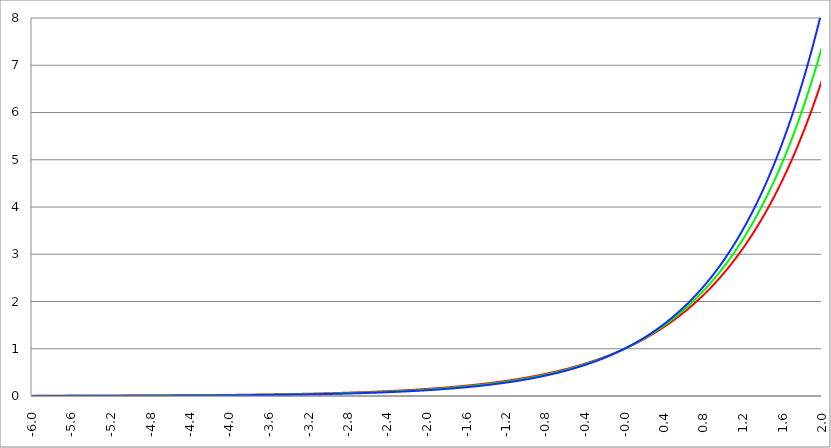
| Category | Series 1 | Series 0 | Series 2 |
|---|---|---|---|
| -6.0 | 0.003 | 0.002 | 0.002 |
| -5.996 | 0.003 | 0.002 | 0.002 |
| -5.992000000000001 | 0.003 | 0.002 | 0.002 |
| -5.988000000000001 | 0.003 | 0.003 | 0.002 |
| -5.984000000000002 | 0.003 | 0.003 | 0.002 |
| -5.980000000000002 | 0.003 | 0.003 | 0.002 |
| -5.976000000000002 | 0.003 | 0.003 | 0.002 |
| -5.972000000000003 | 0.003 | 0.003 | 0.002 |
| -5.968000000000003 | 0.003 | 0.003 | 0.002 |
| -5.964000000000004 | 0.003 | 0.003 | 0.002 |
| -5.960000000000004 | 0.003 | 0.003 | 0.002 |
| -5.956000000000004 | 0.003 | 0.003 | 0.002 |
| -5.952000000000005 | 0.004 | 0.003 | 0.002 |
| -5.948000000000005 | 0.004 | 0.003 | 0.002 |
| -5.944000000000006 | 0.004 | 0.003 | 0.002 |
| -5.940000000000006 | 0.004 | 0.003 | 0.002 |
| -5.936000000000007 | 0.004 | 0.003 | 0.002 |
| -5.932000000000007 | 0.004 | 0.003 | 0.002 |
| -5.928000000000008 | 0.004 | 0.003 | 0.002 |
| -5.924000000000008 | 0.004 | 0.003 | 0.002 |
| -5.920000000000009 | 0.004 | 0.003 | 0.002 |
| -5.91600000000001 | 0.004 | 0.003 | 0.002 |
| -5.91200000000001 | 0.004 | 0.003 | 0.002 |
| -5.90800000000001 | 0.004 | 0.003 | 0.002 |
| -5.904000000000011 | 0.004 | 0.003 | 0.002 |
| -5.900000000000011 | 0.004 | 0.003 | 0.002 |
| -5.896000000000011 | 0.004 | 0.003 | 0.002 |
| -5.892000000000012 | 0.004 | 0.003 | 0.002 |
| -5.888000000000012 | 0.004 | 0.003 | 0.002 |
| -5.884000000000013 | 0.004 | 0.003 | 0.002 |
| -5.880000000000013 | 0.004 | 0.003 | 0.002 |
| -5.876000000000014 | 0.004 | 0.003 | 0.002 |
| -5.872000000000014 | 0.004 | 0.003 | 0.002 |
| -5.868000000000014 | 0.004 | 0.003 | 0.002 |
| -5.864000000000015 | 0.004 | 0.003 | 0.002 |
| -5.860000000000015 | 0.004 | 0.003 | 0.002 |
| -5.856000000000016 | 0.004 | 0.003 | 0.002 |
| -5.852000000000016 | 0.004 | 0.003 | 0.002 |
| -5.848000000000017 | 0.004 | 0.003 | 0.002 |
| -5.844000000000017 | 0.004 | 0.003 | 0.002 |
| -5.840000000000018 | 0.004 | 0.003 | 0.002 |
| -5.836000000000018 | 0.004 | 0.003 | 0.002 |
| -5.832000000000018 | 0.004 | 0.003 | 0.002 |
| -5.828000000000019 | 0.004 | 0.003 | 0.002 |
| -5.824000000000019 | 0.004 | 0.003 | 0.002 |
| -5.82000000000002 | 0.004 | 0.003 | 0.002 |
| -5.81600000000002 | 0.004 | 0.003 | 0.002 |
| -5.812000000000021 | 0.004 | 0.003 | 0.002 |
| -5.808000000000021 | 0.004 | 0.003 | 0.002 |
| -5.804000000000022 | 0.004 | 0.003 | 0.002 |
| -5.800000000000022 | 0.004 | 0.003 | 0.002 |
| -5.796000000000022 | 0.004 | 0.003 | 0.002 |
| -5.792000000000023 | 0.004 | 0.003 | 0.002 |
| -5.788000000000023 | 0.004 | 0.003 | 0.002 |
| -5.784000000000024 | 0.004 | 0.003 | 0.002 |
| -5.780000000000024 | 0.004 | 0.003 | 0.002 |
| -5.776000000000024 | 0.004 | 0.003 | 0.002 |
| -5.772000000000025 | 0.004 | 0.003 | 0.002 |
| -5.768000000000025 | 0.004 | 0.003 | 0.002 |
| -5.764000000000026 | 0.004 | 0.003 | 0.002 |
| -5.760000000000026 | 0.004 | 0.003 | 0.002 |
| -5.756000000000026 | 0.004 | 0.003 | 0.002 |
| -5.752000000000027 | 0.004 | 0.003 | 0.002 |
| -5.748000000000027 | 0.004 | 0.003 | 0.002 |
| -5.744000000000028 | 0.004 | 0.003 | 0.002 |
| -5.740000000000028 | 0.004 | 0.003 | 0.002 |
| -5.73600000000003 | 0.004 | 0.003 | 0.002 |
| -5.73200000000003 | 0.004 | 0.003 | 0.002 |
| -5.72800000000003 | 0.004 | 0.003 | 0.002 |
| -5.72400000000003 | 0.004 | 0.003 | 0.002 |
| -5.720000000000031 | 0.004 | 0.003 | 0.002 |
| -5.716000000000031 | 0.004 | 0.003 | 0.002 |
| -5.712000000000032 | 0.004 | 0.003 | 0.002 |
| -5.708000000000032 | 0.004 | 0.003 | 0.002 |
| -5.704000000000033 | 0.004 | 0.003 | 0.003 |
| -5.700000000000033 | 0.004 | 0.003 | 0.003 |
| -5.696000000000033 | 0.004 | 0.003 | 0.003 |
| -5.692000000000034 | 0.004 | 0.003 | 0.003 |
| -5.688000000000034 | 0.005 | 0.003 | 0.003 |
| -5.684000000000035 | 0.005 | 0.003 | 0.003 |
| -5.680000000000035 | 0.005 | 0.003 | 0.003 |
| -5.676000000000035 | 0.005 | 0.003 | 0.003 |
| -5.672000000000036 | 0.005 | 0.003 | 0.003 |
| -5.668000000000036 | 0.005 | 0.003 | 0.003 |
| -5.664000000000037 | 0.005 | 0.003 | 0.003 |
| -5.660000000000037 | 0.005 | 0.003 | 0.003 |
| -5.656000000000038 | 0.005 | 0.003 | 0.003 |
| -5.652000000000038 | 0.005 | 0.004 | 0.003 |
| -5.648000000000039 | 0.005 | 0.004 | 0.003 |
| -5.644000000000039 | 0.005 | 0.004 | 0.003 |
| -5.64000000000004 | 0.005 | 0.004 | 0.003 |
| -5.63600000000004 | 0.005 | 0.004 | 0.003 |
| -5.63200000000004 | 0.005 | 0.004 | 0.003 |
| -5.628000000000041 | 0.005 | 0.004 | 0.003 |
| -5.624000000000041 | 0.005 | 0.004 | 0.003 |
| -5.620000000000042 | 0.005 | 0.004 | 0.003 |
| -5.616000000000042 | 0.005 | 0.004 | 0.003 |
| -5.612000000000043 | 0.005 | 0.004 | 0.003 |
| -5.608000000000043 | 0.005 | 0.004 | 0.003 |
| -5.604000000000044 | 0.005 | 0.004 | 0.003 |
| -5.600000000000044 | 0.005 | 0.004 | 0.003 |
| -5.596000000000044 | 0.005 | 0.004 | 0.003 |
| -5.592000000000045 | 0.005 | 0.004 | 0.003 |
| -5.588000000000045 | 0.005 | 0.004 | 0.003 |
| -5.584000000000046 | 0.005 | 0.004 | 0.003 |
| -5.580000000000046 | 0.005 | 0.004 | 0.003 |
| -5.576000000000046 | 0.005 | 0.004 | 0.003 |
| -5.572000000000047 | 0.005 | 0.004 | 0.003 |
| -5.568000000000048 | 0.005 | 0.004 | 0.003 |
| -5.564000000000048 | 0.005 | 0.004 | 0.003 |
| -5.560000000000048 | 0.005 | 0.004 | 0.003 |
| -5.556000000000049 | 0.005 | 0.004 | 0.003 |
| -5.552000000000049 | 0.005 | 0.004 | 0.003 |
| -5.54800000000005 | 0.005 | 0.004 | 0.003 |
| -5.54400000000005 | 0.005 | 0.004 | 0.003 |
| -5.540000000000051 | 0.005 | 0.004 | 0.003 |
| -5.536000000000051 | 0.005 | 0.004 | 0.003 |
| -5.532000000000052 | 0.005 | 0.004 | 0.003 |
| -5.528000000000052 | 0.005 | 0.004 | 0.003 |
| -5.524000000000052 | 0.005 | 0.004 | 0.003 |
| -5.520000000000053 | 0.005 | 0.004 | 0.003 |
| -5.516000000000053 | 0.005 | 0.004 | 0.003 |
| -5.512000000000054 | 0.005 | 0.004 | 0.003 |
| -5.508000000000054 | 0.005 | 0.004 | 0.003 |
| -5.504000000000055 | 0.005 | 0.004 | 0.003 |
| -5.500000000000055 | 0.005 | 0.004 | 0.003 |
| -5.496000000000055 | 0.005 | 0.004 | 0.003 |
| -5.492000000000056 | 0.005 | 0.004 | 0.003 |
| -5.488000000000056 | 0.005 | 0.004 | 0.003 |
| -5.484000000000057 | 0.005 | 0.004 | 0.003 |
| -5.480000000000057 | 0.005 | 0.004 | 0.003 |
| -5.476000000000057 | 0.006 | 0.004 | 0.003 |
| -5.472000000000058 | 0.006 | 0.004 | 0.003 |
| -5.468000000000059 | 0.006 | 0.004 | 0.003 |
| -5.464000000000059 | 0.006 | 0.004 | 0.003 |
| -5.460000000000059 | 0.006 | 0.004 | 0.003 |
| -5.45600000000006 | 0.006 | 0.004 | 0.003 |
| -5.45200000000006 | 0.006 | 0.004 | 0.003 |
| -5.44800000000006 | 0.006 | 0.004 | 0.003 |
| -5.444000000000061 | 0.006 | 0.004 | 0.003 |
| -5.440000000000061 | 0.006 | 0.004 | 0.003 |
| -5.436000000000062 | 0.006 | 0.004 | 0.003 |
| -5.432000000000062 | 0.006 | 0.004 | 0.003 |
| -5.428000000000063 | 0.006 | 0.004 | 0.003 |
| -5.424000000000063 | 0.006 | 0.004 | 0.003 |
| -5.420000000000064 | 0.006 | 0.004 | 0.003 |
| -5.416000000000064 | 0.006 | 0.004 | 0.003 |
| -5.412000000000064 | 0.006 | 0.004 | 0.003 |
| -5.408000000000065 | 0.006 | 0.004 | 0.003 |
| -5.404000000000065 | 0.006 | 0.004 | 0.003 |
| -5.400000000000066 | 0.006 | 0.005 | 0.003 |
| -5.396000000000066 | 0.006 | 0.005 | 0.003 |
| -5.392000000000067 | 0.006 | 0.005 | 0.003 |
| -5.388000000000067 | 0.006 | 0.005 | 0.003 |
| -5.384000000000068 | 0.006 | 0.005 | 0.004 |
| -5.380000000000068 | 0.006 | 0.005 | 0.004 |
| -5.376000000000068 | 0.006 | 0.005 | 0.004 |
| -5.37200000000007 | 0.006 | 0.005 | 0.004 |
| -5.36800000000007 | 0.006 | 0.005 | 0.004 |
| -5.36400000000007 | 0.006 | 0.005 | 0.004 |
| -5.36000000000007 | 0.006 | 0.005 | 0.004 |
| -5.356000000000071 | 0.006 | 0.005 | 0.004 |
| -5.352000000000071 | 0.006 | 0.005 | 0.004 |
| -5.348000000000072 | 0.006 | 0.005 | 0.004 |
| -5.344000000000072 | 0.006 | 0.005 | 0.004 |
| -5.340000000000073 | 0.006 | 0.005 | 0.004 |
| -5.336000000000073 | 0.006 | 0.005 | 0.004 |
| -5.332000000000074 | 0.006 | 0.005 | 0.004 |
| -5.328000000000074 | 0.006 | 0.005 | 0.004 |
| -5.324000000000074 | 0.006 | 0.005 | 0.004 |
| -5.320000000000075 | 0.006 | 0.005 | 0.004 |
| -5.316000000000075 | 0.006 | 0.005 | 0.004 |
| -5.312000000000076 | 0.006 | 0.005 | 0.004 |
| -5.308000000000076 | 0.006 | 0.005 | 0.004 |
| -5.304000000000077 | 0.006 | 0.005 | 0.004 |
| -5.300000000000077 | 0.007 | 0.005 | 0.004 |
| -5.296000000000077 | 0.007 | 0.005 | 0.004 |
| -5.292000000000078 | 0.007 | 0.005 | 0.004 |
| -5.288000000000078 | 0.007 | 0.005 | 0.004 |
| -5.284000000000079 | 0.007 | 0.005 | 0.004 |
| -5.28000000000008 | 0.007 | 0.005 | 0.004 |
| -5.27600000000008 | 0.007 | 0.005 | 0.004 |
| -5.27200000000008 | 0.007 | 0.005 | 0.004 |
| -5.268000000000081 | 0.007 | 0.005 | 0.004 |
| -5.264000000000081 | 0.007 | 0.005 | 0.004 |
| -5.260000000000081 | 0.007 | 0.005 | 0.004 |
| -5.256000000000082 | 0.007 | 0.005 | 0.004 |
| -5.252000000000082 | 0.007 | 0.005 | 0.004 |
| -5.248000000000083 | 0.007 | 0.005 | 0.004 |
| -5.244000000000083 | 0.007 | 0.005 | 0.004 |
| -5.240000000000084 | 0.007 | 0.005 | 0.004 |
| -5.236000000000084 | 0.007 | 0.005 | 0.004 |
| -5.232000000000084 | 0.007 | 0.005 | 0.004 |
| -5.228000000000085 | 0.007 | 0.005 | 0.004 |
| -5.224000000000085 | 0.007 | 0.005 | 0.004 |
| -5.220000000000086 | 0.007 | 0.005 | 0.004 |
| -5.216000000000086 | 0.007 | 0.005 | 0.004 |
| -5.212000000000087 | 0.007 | 0.005 | 0.004 |
| -5.208000000000087 | 0.007 | 0.005 | 0.004 |
| -5.204000000000088 | 0.007 | 0.005 | 0.004 |
| -5.200000000000088 | 0.007 | 0.006 | 0.004 |
| -5.196000000000089 | 0.007 | 0.006 | 0.004 |
| -5.192000000000089 | 0.007 | 0.006 | 0.004 |
| -5.188000000000089 | 0.007 | 0.006 | 0.004 |
| -5.18400000000009 | 0.007 | 0.006 | 0.004 |
| -5.18000000000009 | 0.007 | 0.006 | 0.004 |
| -5.176000000000091 | 0.007 | 0.006 | 0.004 |
| -5.172000000000091 | 0.007 | 0.006 | 0.004 |
| -5.168000000000092 | 0.007 | 0.006 | 0.004 |
| -5.164000000000092 | 0.007 | 0.006 | 0.004 |
| -5.160000000000092 | 0.007 | 0.006 | 0.004 |
| -5.156000000000093 | 0.007 | 0.006 | 0.004 |
| -5.152000000000093 | 0.007 | 0.006 | 0.004 |
| -5.148000000000094 | 0.008 | 0.006 | 0.004 |
| -5.144000000000094 | 0.008 | 0.006 | 0.005 |
| -5.140000000000095 | 0.008 | 0.006 | 0.005 |
| -5.136000000000095 | 0.008 | 0.006 | 0.005 |
| -5.132000000000096 | 0.008 | 0.006 | 0.005 |
| -5.128000000000096 | 0.008 | 0.006 | 0.005 |
| -5.124000000000096 | 0.008 | 0.006 | 0.005 |
| -5.120000000000097 | 0.008 | 0.006 | 0.005 |
| -5.116000000000097 | 0.008 | 0.006 | 0.005 |
| -5.112000000000098 | 0.008 | 0.006 | 0.005 |
| -5.108000000000098 | 0.008 | 0.006 | 0.005 |
| -5.104000000000099 | 0.008 | 0.006 | 0.005 |
| -5.100000000000099 | 0.008 | 0.006 | 0.005 |
| -5.0960000000001 | 0.008 | 0.006 | 0.005 |
| -5.0920000000001 | 0.008 | 0.006 | 0.005 |
| -5.0880000000001 | 0.008 | 0.006 | 0.005 |
| -5.084000000000101 | 0.008 | 0.006 | 0.005 |
| -5.080000000000101 | 0.008 | 0.006 | 0.005 |
| -5.076000000000101 | 0.008 | 0.006 | 0.005 |
| -5.072000000000102 | 0.008 | 0.006 | 0.005 |
| -5.068000000000103 | 0.008 | 0.006 | 0.005 |
| -5.064000000000103 | 0.008 | 0.006 | 0.005 |
| -5.060000000000104 | 0.008 | 0.006 | 0.005 |
| -5.056000000000104 | 0.008 | 0.006 | 0.005 |
| -5.052000000000104 | 0.008 | 0.006 | 0.005 |
| -5.048000000000104 | 0.008 | 0.006 | 0.005 |
| -5.044000000000105 | 0.008 | 0.006 | 0.005 |
| -5.040000000000105 | 0.008 | 0.006 | 0.005 |
| -5.036000000000106 | 0.008 | 0.006 | 0.005 |
| -5.032000000000106 | 0.008 | 0.007 | 0.005 |
| -5.028000000000107 | 0.008 | 0.007 | 0.005 |
| -5.024000000000107 | 0.008 | 0.007 | 0.005 |
| -5.020000000000108 | 0.008 | 0.007 | 0.005 |
| -5.016000000000108 | 0.009 | 0.007 | 0.005 |
| -5.012000000000109 | 0.009 | 0.007 | 0.005 |
| -5.00800000000011 | 0.009 | 0.007 | 0.005 |
| -5.00400000000011 | 0.009 | 0.007 | 0.005 |
| -5.00000000000011 | 0.009 | 0.007 | 0.005 |
| -4.99600000000011 | 0.009 | 0.007 | 0.005 |
| -4.992000000000111 | 0.009 | 0.007 | 0.005 |
| -4.988000000000111 | 0.009 | 0.007 | 0.005 |
| -4.984000000000112 | 0.009 | 0.007 | 0.005 |
| -4.980000000000112 | 0.009 | 0.007 | 0.005 |
| -4.976000000000112 | 0.009 | 0.007 | 0.005 |
| -4.972000000000113 | 0.009 | 0.007 | 0.005 |
| -4.968000000000114 | 0.009 | 0.007 | 0.005 |
| -4.964000000000114 | 0.009 | 0.007 | 0.005 |
| -4.960000000000114 | 0.009 | 0.007 | 0.005 |
| -4.956000000000114 | 0.009 | 0.007 | 0.005 |
| -4.952000000000115 | 0.009 | 0.007 | 0.006 |
| -4.948000000000115 | 0.009 | 0.007 | 0.006 |
| -4.944000000000116 | 0.009 | 0.007 | 0.006 |
| -4.940000000000116 | 0.009 | 0.007 | 0.006 |
| -4.936000000000117 | 0.009 | 0.007 | 0.006 |
| -4.932000000000117 | 0.009 | 0.007 | 0.006 |
| -4.928000000000118 | 0.009 | 0.007 | 0.006 |
| -4.924000000000118 | 0.009 | 0.007 | 0.006 |
| -4.920000000000119 | 0.009 | 0.007 | 0.006 |
| -4.91600000000012 | 0.009 | 0.007 | 0.006 |
| -4.91200000000012 | 0.009 | 0.007 | 0.006 |
| -4.90800000000012 | 0.009 | 0.007 | 0.006 |
| -4.90400000000012 | 0.009 | 0.007 | 0.006 |
| -4.90000000000012 | 0.01 | 0.007 | 0.006 |
| -4.896000000000121 | 0.01 | 0.007 | 0.006 |
| -4.892000000000122 | 0.01 | 0.008 | 0.006 |
| -4.888000000000122 | 0.01 | 0.008 | 0.006 |
| -4.884000000000123 | 0.01 | 0.008 | 0.006 |
| -4.880000000000123 | 0.01 | 0.008 | 0.006 |
| -4.876000000000123 | 0.01 | 0.008 | 0.006 |
| -4.872000000000124 | 0.01 | 0.008 | 0.006 |
| -4.868000000000124 | 0.01 | 0.008 | 0.006 |
| -4.864000000000125 | 0.01 | 0.008 | 0.006 |
| -4.860000000000125 | 0.01 | 0.008 | 0.006 |
| -4.856000000000125 | 0.01 | 0.008 | 0.006 |
| -4.852000000000126 | 0.01 | 0.008 | 0.006 |
| -4.848000000000126 | 0.01 | 0.008 | 0.006 |
| -4.844000000000127 | 0.01 | 0.008 | 0.006 |
| -4.840000000000127 | 0.01 | 0.008 | 0.006 |
| -4.836000000000128 | 0.01 | 0.008 | 0.006 |
| -4.832000000000128 | 0.01 | 0.008 | 0.006 |
| -4.82800000000013 | 0.01 | 0.008 | 0.006 |
| -4.824000000000129 | 0.01 | 0.008 | 0.006 |
| -4.82000000000013 | 0.01 | 0.008 | 0.006 |
| -4.81600000000013 | 0.01 | 0.008 | 0.006 |
| -4.812000000000131 | 0.01 | 0.008 | 0.006 |
| -4.808000000000131 | 0.01 | 0.008 | 0.006 |
| -4.804000000000132 | 0.01 | 0.008 | 0.006 |
| -4.800000000000132 | 0.01 | 0.008 | 0.006 |
| -4.796000000000132 | 0.011 | 0.008 | 0.007 |
| -4.792000000000133 | 0.011 | 0.008 | 0.007 |
| -4.788000000000133 | 0.011 | 0.008 | 0.007 |
| -4.784000000000134 | 0.011 | 0.008 | 0.007 |
| -4.780000000000134 | 0.011 | 0.008 | 0.007 |
| -4.776000000000134 | 0.011 | 0.008 | 0.007 |
| -4.772000000000135 | 0.011 | 0.008 | 0.007 |
| -4.768000000000135 | 0.011 | 0.008 | 0.007 |
| -4.764000000000136 | 0.011 | 0.009 | 0.007 |
| -4.760000000000136 | 0.011 | 0.009 | 0.007 |
| -4.756000000000136 | 0.011 | 0.009 | 0.007 |
| -4.752000000000137 | 0.011 | 0.009 | 0.007 |
| -4.748000000000137 | 0.011 | 0.009 | 0.007 |
| -4.744000000000138 | 0.011 | 0.009 | 0.007 |
| -4.740000000000138 | 0.011 | 0.009 | 0.007 |
| -4.73600000000014 | 0.011 | 0.009 | 0.007 |
| -4.73200000000014 | 0.011 | 0.009 | 0.007 |
| -4.72800000000014 | 0.011 | 0.009 | 0.007 |
| -4.72400000000014 | 0.011 | 0.009 | 0.007 |
| -4.720000000000141 | 0.011 | 0.009 | 0.007 |
| -4.716000000000141 | 0.011 | 0.009 | 0.007 |
| -4.712000000000142 | 0.011 | 0.009 | 0.007 |
| -4.708000000000142 | 0.011 | 0.009 | 0.007 |
| -4.704000000000143 | 0.011 | 0.009 | 0.007 |
| -4.700000000000143 | 0.012 | 0.009 | 0.007 |
| -4.696000000000143 | 0.012 | 0.009 | 0.007 |
| -4.692000000000144 | 0.012 | 0.009 | 0.007 |
| -4.688000000000144 | 0.012 | 0.009 | 0.007 |
| -4.684000000000145 | 0.012 | 0.009 | 0.007 |
| -4.680000000000145 | 0.012 | 0.009 | 0.007 |
| -4.676000000000145 | 0.012 | 0.009 | 0.007 |
| -4.672000000000146 | 0.012 | 0.009 | 0.007 |
| -4.668000000000147 | 0.012 | 0.009 | 0.007 |
| -4.664000000000147 | 0.012 | 0.009 | 0.007 |
| -4.660000000000147 | 0.012 | 0.009 | 0.007 |
| -4.656000000000148 | 0.012 | 0.01 | 0.008 |
| -4.652000000000148 | 0.012 | 0.01 | 0.008 |
| -4.648000000000149 | 0.012 | 0.01 | 0.008 |
| -4.644000000000149 | 0.012 | 0.01 | 0.008 |
| -4.64000000000015 | 0.012 | 0.01 | 0.008 |
| -4.63600000000015 | 0.012 | 0.01 | 0.008 |
| -4.632000000000151 | 0.012 | 0.01 | 0.008 |
| -4.628000000000151 | 0.012 | 0.01 | 0.008 |
| -4.624000000000151 | 0.012 | 0.01 | 0.008 |
| -4.620000000000152 | 0.012 | 0.01 | 0.008 |
| -4.616000000000152 | 0.012 | 0.01 | 0.008 |
| -4.612000000000153 | 0.013 | 0.01 | 0.008 |
| -4.608000000000153 | 0.013 | 0.01 | 0.008 |
| -4.604000000000154 | 0.013 | 0.01 | 0.008 |
| -4.600000000000154 | 0.013 | 0.01 | 0.008 |
| -4.596000000000154 | 0.013 | 0.01 | 0.008 |
| -4.592000000000155 | 0.013 | 0.01 | 0.008 |
| -4.588000000000155 | 0.013 | 0.01 | 0.008 |
| -4.584000000000156 | 0.013 | 0.01 | 0.008 |
| -4.580000000000156 | 0.013 | 0.01 | 0.008 |
| -4.576000000000156 | 0.013 | 0.01 | 0.008 |
| -4.572000000000157 | 0.013 | 0.01 | 0.008 |
| -4.568000000000158 | 0.013 | 0.01 | 0.008 |
| -4.564000000000158 | 0.013 | 0.01 | 0.008 |
| -4.560000000000159 | 0.013 | 0.01 | 0.008 |
| -4.55600000000016 | 0.013 | 0.011 | 0.008 |
| -4.552000000000159 | 0.013 | 0.011 | 0.008 |
| -4.54800000000016 | 0.013 | 0.011 | 0.008 |
| -4.54400000000016 | 0.013 | 0.011 | 0.008 |
| -4.54000000000016 | 0.013 | 0.011 | 0.009 |
| -4.53600000000016 | 0.013 | 0.011 | 0.009 |
| -4.532000000000161 | 0.013 | 0.011 | 0.009 |
| -4.528000000000162 | 0.014 | 0.011 | 0.009 |
| -4.524000000000163 | 0.014 | 0.011 | 0.009 |
| -4.520000000000163 | 0.014 | 0.011 | 0.009 |
| -4.516000000000163 | 0.014 | 0.011 | 0.009 |
| -4.512000000000164 | 0.014 | 0.011 | 0.009 |
| -4.508000000000164 | 0.014 | 0.011 | 0.009 |
| -4.504000000000164 | 0.014 | 0.011 | 0.009 |
| -4.500000000000165 | 0.014 | 0.011 | 0.009 |
| -4.496000000000165 | 0.014 | 0.011 | 0.009 |
| -4.492000000000166 | 0.014 | 0.011 | 0.009 |
| -4.488000000000166 | 0.014 | 0.011 | 0.009 |
| -4.484000000000166 | 0.014 | 0.011 | 0.009 |
| -4.480000000000167 | 0.014 | 0.011 | 0.009 |
| -4.476000000000167 | 0.014 | 0.011 | 0.009 |
| -4.472000000000168 | 0.014 | 0.011 | 0.009 |
| -4.468000000000168 | 0.014 | 0.011 | 0.009 |
| -4.46400000000017 | 0.014 | 0.012 | 0.009 |
| -4.46000000000017 | 0.014 | 0.012 | 0.009 |
| -4.45600000000017 | 0.015 | 0.012 | 0.009 |
| -4.45200000000017 | 0.015 | 0.012 | 0.009 |
| -4.44800000000017 | 0.015 | 0.012 | 0.009 |
| -4.444000000000171 | 0.015 | 0.012 | 0.009 |
| -4.440000000000171 | 0.015 | 0.012 | 0.009 |
| -4.436000000000172 | 0.015 | 0.012 | 0.009 |
| -4.432000000000172 | 0.015 | 0.012 | 0.01 |
| -4.428000000000173 | 0.015 | 0.012 | 0.01 |
| -4.424000000000174 | 0.015 | 0.012 | 0.01 |
| -4.420000000000174 | 0.015 | 0.012 | 0.01 |
| -4.416000000000174 | 0.015 | 0.012 | 0.01 |
| -4.412000000000174 | 0.015 | 0.012 | 0.01 |
| -4.408000000000175 | 0.015 | 0.012 | 0.01 |
| -4.404000000000175 | 0.015 | 0.012 | 0.01 |
| -4.400000000000176 | 0.015 | 0.012 | 0.01 |
| -4.396000000000176 | 0.015 | 0.012 | 0.01 |
| -4.392000000000177 | 0.015 | 0.012 | 0.01 |
| -4.388000000000177 | 0.015 | 0.012 | 0.01 |
| -4.384000000000178 | 0.016 | 0.012 | 0.01 |
| -4.380000000000178 | 0.016 | 0.013 | 0.01 |
| -4.376000000000178 | 0.016 | 0.013 | 0.01 |
| -4.37200000000018 | 0.016 | 0.013 | 0.01 |
| -4.36800000000018 | 0.016 | 0.013 | 0.01 |
| -4.36400000000018 | 0.016 | 0.013 | 0.01 |
| -4.360000000000181 | 0.016 | 0.013 | 0.01 |
| -4.356000000000181 | 0.016 | 0.013 | 0.01 |
| -4.352000000000181 | 0.016 | 0.013 | 0.01 |
| -4.348000000000182 | 0.016 | 0.013 | 0.01 |
| -4.344000000000182 | 0.016 | 0.013 | 0.01 |
| -4.340000000000183 | 0.016 | 0.013 | 0.01 |
| -4.336000000000183 | 0.016 | 0.013 | 0.011 |
| -4.332000000000184 | 0.016 | 0.013 | 0.011 |
| -4.328000000000184 | 0.016 | 0.013 | 0.011 |
| -4.324000000000185 | 0.016 | 0.013 | 0.011 |
| -4.320000000000185 | 0.017 | 0.013 | 0.011 |
| -4.316000000000185 | 0.017 | 0.013 | 0.011 |
| -4.312000000000186 | 0.017 | 0.013 | 0.011 |
| -4.308000000000186 | 0.017 | 0.013 | 0.011 |
| -4.304000000000187 | 0.017 | 0.014 | 0.011 |
| -4.300000000000187 | 0.017 | 0.014 | 0.011 |
| -4.296000000000187 | 0.017 | 0.014 | 0.011 |
| -4.292000000000188 | 0.017 | 0.014 | 0.011 |
| -4.288000000000188 | 0.017 | 0.014 | 0.011 |
| -4.284000000000189 | 0.017 | 0.014 | 0.011 |
| -4.28000000000019 | 0.017 | 0.014 | 0.011 |
| -4.27600000000019 | 0.017 | 0.014 | 0.011 |
| -4.27200000000019 | 0.017 | 0.014 | 0.011 |
| -4.268000000000191 | 0.017 | 0.014 | 0.011 |
| -4.264000000000191 | 0.017 | 0.014 | 0.011 |
| -4.260000000000192 | 0.017 | 0.014 | 0.011 |
| -4.256000000000192 | 0.018 | 0.014 | 0.011 |
| -4.252000000000192 | 0.018 | 0.014 | 0.012 |
| -4.248000000000193 | 0.018 | 0.014 | 0.012 |
| -4.244000000000193 | 0.018 | 0.014 | 0.012 |
| -4.240000000000194 | 0.018 | 0.014 | 0.012 |
| -4.236000000000194 | 0.018 | 0.014 | 0.012 |
| -4.232000000000194 | 0.018 | 0.015 | 0.012 |
| -4.228000000000195 | 0.018 | 0.015 | 0.012 |
| -4.224000000000196 | 0.018 | 0.015 | 0.012 |
| -4.220000000000196 | 0.018 | 0.015 | 0.012 |
| -4.216000000000196 | 0.018 | 0.015 | 0.012 |
| -4.212000000000197 | 0.018 | 0.015 | 0.012 |
| -4.208000000000197 | 0.018 | 0.015 | 0.012 |
| -4.204000000000198 | 0.018 | 0.015 | 0.012 |
| -4.200000000000198 | 0.018 | 0.015 | 0.012 |
| -4.196000000000199 | 0.019 | 0.015 | 0.012 |
| -4.192000000000199 | 0.019 | 0.015 | 0.012 |
| -4.1880000000002 | 0.019 | 0.015 | 0.012 |
| -4.1840000000002 | 0.019 | 0.015 | 0.012 |
| -4.1800000000002 | 0.019 | 0.015 | 0.012 |
| -4.176000000000201 | 0.019 | 0.015 | 0.012 |
| -4.172000000000201 | 0.019 | 0.015 | 0.013 |
| -4.168000000000202 | 0.019 | 0.015 | 0.013 |
| -4.164000000000202 | 0.019 | 0.016 | 0.013 |
| -4.160000000000203 | 0.019 | 0.016 | 0.013 |
| -4.156000000000203 | 0.019 | 0.016 | 0.013 |
| -4.152000000000204 | 0.019 | 0.016 | 0.013 |
| -4.148000000000204 | 0.019 | 0.016 | 0.013 |
| -4.144000000000204 | 0.02 | 0.016 | 0.013 |
| -4.140000000000205 | 0.02 | 0.016 | 0.013 |
| -4.136000000000205 | 0.02 | 0.016 | 0.013 |
| -4.132000000000206 | 0.02 | 0.016 | 0.013 |
| -4.128000000000206 | 0.02 | 0.016 | 0.013 |
| -4.124000000000207 | 0.02 | 0.016 | 0.013 |
| -4.120000000000207 | 0.02 | 0.016 | 0.013 |
| -4.116000000000207 | 0.02 | 0.016 | 0.013 |
| -4.112000000000208 | 0.02 | 0.016 | 0.013 |
| -4.108000000000208 | 0.02 | 0.016 | 0.013 |
| -4.104000000000209 | 0.02 | 0.017 | 0.013 |
| -4.100000000000209 | 0.02 | 0.017 | 0.014 |
| -4.09600000000021 | 0.02 | 0.017 | 0.014 |
| -4.09200000000021 | 0.02 | 0.017 | 0.014 |
| -4.088000000000211 | 0.021 | 0.017 | 0.014 |
| -4.084000000000211 | 0.021 | 0.017 | 0.014 |
| -4.080000000000211 | 0.021 | 0.017 | 0.014 |
| -4.076000000000212 | 0.021 | 0.017 | 0.014 |
| -4.072000000000212 | 0.021 | 0.017 | 0.014 |
| -4.068000000000213 | 0.021 | 0.017 | 0.014 |
| -4.064000000000213 | 0.021 | 0.017 | 0.014 |
| -4.060000000000214 | 0.021 | 0.017 | 0.014 |
| -4.056000000000214 | 0.021 | 0.017 | 0.014 |
| -4.052000000000215 | 0.021 | 0.017 | 0.014 |
| -4.048000000000215 | 0.021 | 0.017 | 0.014 |
| -4.044000000000215 | 0.021 | 0.018 | 0.014 |
| -4.040000000000216 | 0.022 | 0.018 | 0.014 |
| -4.036000000000216 | 0.022 | 0.018 | 0.014 |
| -4.032000000000217 | 0.022 | 0.018 | 0.015 |
| -4.028000000000217 | 0.022 | 0.018 | 0.015 |
| -4.024000000000218 | 0.022 | 0.018 | 0.015 |
| -4.020000000000218 | 0.022 | 0.018 | 0.015 |
| -4.016000000000219 | 0.022 | 0.018 | 0.015 |
| -4.012000000000219 | 0.022 | 0.018 | 0.015 |
| -4.008000000000219 | 0.022 | 0.018 | 0.015 |
| -4.00400000000022 | 0.022 | 0.018 | 0.015 |
| -4.00000000000022 | 0.022 | 0.018 | 0.015 |
| -3.99600000000022 | 0.022 | 0.018 | 0.015 |
| -3.99200000000022 | 0.023 | 0.018 | 0.015 |
| -3.98800000000022 | 0.023 | 0.019 | 0.015 |
| -3.98400000000022 | 0.023 | 0.019 | 0.015 |
| -3.98000000000022 | 0.023 | 0.019 | 0.015 |
| -3.97600000000022 | 0.023 | 0.019 | 0.015 |
| -3.97200000000022 | 0.023 | 0.019 | 0.015 |
| -3.96800000000022 | 0.023 | 0.019 | 0.016 |
| -3.96400000000022 | 0.023 | 0.019 | 0.016 |
| -3.96000000000022 | 0.023 | 0.019 | 0.016 |
| -3.95600000000022 | 0.023 | 0.019 | 0.016 |
| -3.95200000000022 | 0.023 | 0.019 | 0.016 |
| -3.94800000000022 | 0.024 | 0.019 | 0.016 |
| -3.94400000000022 | 0.024 | 0.019 | 0.016 |
| -3.94000000000022 | 0.024 | 0.019 | 0.016 |
| -3.93600000000022 | 0.024 | 0.02 | 0.016 |
| -3.93200000000022 | 0.024 | 0.02 | 0.016 |
| -3.92800000000022 | 0.024 | 0.02 | 0.016 |
| -3.92400000000022 | 0.024 | 0.02 | 0.016 |
| -3.92000000000022 | 0.024 | 0.02 | 0.016 |
| -3.91600000000022 | 0.024 | 0.02 | 0.016 |
| -3.91200000000022 | 0.024 | 0.02 | 0.016 |
| -3.90800000000022 | 0.024 | 0.02 | 0.017 |
| -3.90400000000022 | 0.025 | 0.02 | 0.017 |
| -3.90000000000022 | 0.025 | 0.02 | 0.017 |
| -3.89600000000022 | 0.025 | 0.02 | 0.017 |
| -3.89200000000022 | 0.025 | 0.02 | 0.017 |
| -3.88800000000022 | 0.025 | 0.02 | 0.017 |
| -3.88400000000022 | 0.025 | 0.021 | 0.017 |
| -3.88000000000022 | 0.025 | 0.021 | 0.017 |
| -3.87600000000022 | 0.025 | 0.021 | 0.017 |
| -3.87200000000022 | 0.025 | 0.021 | 0.017 |
| -3.86800000000022 | 0.025 | 0.021 | 0.017 |
| -3.86400000000022 | 0.025 | 0.021 | 0.017 |
| -3.86000000000022 | 0.026 | 0.021 | 0.017 |
| -3.85600000000022 | 0.026 | 0.021 | 0.017 |
| -3.85200000000022 | 0.026 | 0.021 | 0.018 |
| -3.84800000000022 | 0.026 | 0.021 | 0.018 |
| -3.84400000000022 | 0.026 | 0.021 | 0.018 |
| -3.84000000000022 | 0.026 | 0.021 | 0.018 |
| -3.83600000000022 | 0.026 | 0.022 | 0.018 |
| -3.83200000000022 | 0.026 | 0.022 | 0.018 |
| -3.82800000000022 | 0.026 | 0.022 | 0.018 |
| -3.82400000000022 | 0.026 | 0.022 | 0.018 |
| -3.82000000000022 | 0.027 | 0.022 | 0.018 |
| -3.81600000000022 | 0.027 | 0.022 | 0.018 |
| -3.81200000000022 | 0.027 | 0.022 | 0.018 |
| -3.80800000000022 | 0.027 | 0.022 | 0.018 |
| -3.80400000000022 | 0.027 | 0.022 | 0.018 |
| -3.80000000000022 | 0.027 | 0.022 | 0.018 |
| -3.79600000000022 | 0.027 | 0.022 | 0.019 |
| -3.79200000000022 | 0.027 | 0.023 | 0.019 |
| -3.78800000000022 | 0.027 | 0.023 | 0.019 |
| -3.78400000000022 | 0.027 | 0.023 | 0.019 |
| -3.78000000000022 | 0.028 | 0.023 | 0.019 |
| -3.77600000000022 | 0.028 | 0.023 | 0.019 |
| -3.77200000000022 | 0.028 | 0.023 | 0.019 |
| -3.76800000000022 | 0.028 | 0.023 | 0.019 |
| -3.76400000000022 | 0.028 | 0.023 | 0.019 |
| -3.76000000000022 | 0.028 | 0.023 | 0.019 |
| -3.75600000000022 | 0.028 | 0.023 | 0.019 |
| -3.75200000000022 | 0.028 | 0.023 | 0.019 |
| -3.74800000000022 | 0.028 | 0.024 | 0.02 |
| -3.74400000000022 | 0.029 | 0.024 | 0.02 |
| -3.74000000000022 | 0.029 | 0.024 | 0.02 |
| -3.73600000000022 | 0.029 | 0.024 | 0.02 |
| -3.73200000000022 | 0.029 | 0.024 | 0.02 |
| -3.72800000000022 | 0.029 | 0.024 | 0.02 |
| -3.72400000000022 | 0.029 | 0.024 | 0.02 |
| -3.72000000000022 | 0.029 | 0.024 | 0.02 |
| -3.71600000000022 | 0.029 | 0.024 | 0.02 |
| -3.71200000000022 | 0.029 | 0.024 | 0.02 |
| -3.70800000000022 | 0.03 | 0.025 | 0.02 |
| -3.70400000000022 | 0.03 | 0.025 | 0.02 |
| -3.70000000000022 | 0.03 | 0.025 | 0.021 |
| -3.69600000000022 | 0.03 | 0.025 | 0.021 |
| -3.69200000000022 | 0.03 | 0.025 | 0.021 |
| -3.68800000000022 | 0.03 | 0.025 | 0.021 |
| -3.68400000000022 | 0.03 | 0.025 | 0.021 |
| -3.68000000000022 | 0.03 | 0.025 | 0.021 |
| -3.67600000000022 | 0.03 | 0.025 | 0.021 |
| -3.67200000000022 | 0.031 | 0.025 | 0.021 |
| -3.66800000000022 | 0.031 | 0.026 | 0.021 |
| -3.66400000000022 | 0.031 | 0.026 | 0.021 |
| -3.66000000000022 | 0.031 | 0.026 | 0.021 |
| -3.65600000000022 | 0.031 | 0.026 | 0.022 |
| -3.65200000000022 | 0.031 | 0.026 | 0.022 |
| -3.64800000000022 | 0.031 | 0.026 | 0.022 |
| -3.64400000000022 | 0.031 | 0.026 | 0.022 |
| -3.64000000000022 | 0.031 | 0.026 | 0.022 |
| -3.63600000000022 | 0.032 | 0.026 | 0.022 |
| -3.63200000000022 | 0.032 | 0.026 | 0.022 |
| -3.62800000000022 | 0.032 | 0.027 | 0.022 |
| -3.62400000000022 | 0.032 | 0.027 | 0.022 |
| -3.62000000000022 | 0.032 | 0.027 | 0.022 |
| -3.61600000000022 | 0.032 | 0.027 | 0.022 |
| -3.61200000000022 | 0.032 | 0.027 | 0.023 |
| -3.60800000000022 | 0.032 | 0.027 | 0.023 |
| -3.60400000000022 | 0.033 | 0.027 | 0.023 |
| -3.60000000000022 | 0.033 | 0.027 | 0.023 |
| -3.59600000000022 | 0.033 | 0.027 | 0.023 |
| -3.59200000000022 | 0.033 | 0.028 | 0.023 |
| -3.58800000000022 | 0.033 | 0.028 | 0.023 |
| -3.58400000000022 | 0.033 | 0.028 | 0.023 |
| -3.58000000000022 | 0.033 | 0.028 | 0.023 |
| -3.57600000000022 | 0.033 | 0.028 | 0.023 |
| -3.57200000000022 | 0.034 | 0.028 | 0.024 |
| -3.56800000000022 | 0.034 | 0.028 | 0.024 |
| -3.56400000000022 | 0.034 | 0.028 | 0.024 |
| -3.56000000000022 | 0.034 | 0.028 | 0.024 |
| -3.55600000000022 | 0.034 | 0.029 | 0.024 |
| -3.55200000000022 | 0.034 | 0.029 | 0.024 |
| -3.54800000000022 | 0.034 | 0.029 | 0.024 |
| -3.54400000000022 | 0.034 | 0.029 | 0.024 |
| -3.54000000000022 | 0.035 | 0.029 | 0.024 |
| -3.53600000000022 | 0.035 | 0.029 | 0.024 |
| -3.53200000000022 | 0.035 | 0.029 | 0.025 |
| -3.52800000000022 | 0.035 | 0.029 | 0.025 |
| -3.52400000000022 | 0.035 | 0.029 | 0.025 |
| -3.52000000000022 | 0.035 | 0.03 | 0.025 |
| -3.51600000000022 | 0.035 | 0.03 | 0.025 |
| -3.51200000000022 | 0.036 | 0.03 | 0.025 |
| -3.50800000000022 | 0.036 | 0.03 | 0.025 |
| -3.50400000000022 | 0.036 | 0.03 | 0.025 |
| -3.50000000000022 | 0.036 | 0.03 | 0.025 |
| -3.49600000000022 | 0.036 | 0.03 | 0.025 |
| -3.49200000000022 | 0.036 | 0.03 | 0.026 |
| -3.48800000000022 | 0.036 | 0.031 | 0.026 |
| -3.48400000000022 | 0.037 | 0.031 | 0.026 |
| -3.48000000000022 | 0.037 | 0.031 | 0.026 |
| -3.47600000000022 | 0.037 | 0.031 | 0.026 |
| -3.47200000000022 | 0.037 | 0.031 | 0.026 |
| -3.46800000000022 | 0.037 | 0.031 | 0.026 |
| -3.46400000000022 | 0.037 | 0.031 | 0.026 |
| -3.46000000000022 | 0.037 | 0.031 | 0.026 |
| -3.45600000000022 | 0.038 | 0.032 | 0.027 |
| -3.45200000000022 | 0.038 | 0.032 | 0.027 |
| -3.44800000000022 | 0.038 | 0.032 | 0.027 |
| -3.44400000000022 | 0.038 | 0.032 | 0.027 |
| -3.44000000000022 | 0.038 | 0.032 | 0.027 |
| -3.43600000000022 | 0.038 | 0.032 | 0.027 |
| -3.43200000000022 | 0.038 | 0.032 | 0.027 |
| -3.42800000000022 | 0.039 | 0.032 | 0.027 |
| -3.42400000000022 | 0.039 | 0.033 | 0.027 |
| -3.42000000000022 | 0.039 | 0.033 | 0.028 |
| -3.41600000000022 | 0.039 | 0.033 | 0.028 |
| -3.41200000000022 | 0.039 | 0.033 | 0.028 |
| -3.40800000000022 | 0.039 | 0.033 | 0.028 |
| -3.40400000000022 | 0.039 | 0.033 | 0.028 |
| -3.40000000000022 | 0.04 | 0.033 | 0.028 |
| -3.39600000000022 | 0.04 | 0.034 | 0.028 |
| -3.39200000000022 | 0.04 | 0.034 | 0.028 |
| -3.38800000000022 | 0.04 | 0.034 | 0.029 |
| -3.38400000000022 | 0.04 | 0.034 | 0.029 |
| -3.38000000000022 | 0.04 | 0.034 | 0.029 |
| -3.37600000000022 | 0.04 | 0.034 | 0.029 |
| -3.37200000000022 | 0.041 | 0.034 | 0.029 |
| -3.36800000000022 | 0.041 | 0.034 | 0.029 |
| -3.36400000000022 | 0.041 | 0.035 | 0.029 |
| -3.36000000000022 | 0.041 | 0.035 | 0.029 |
| -3.35600000000022 | 0.041 | 0.035 | 0.029 |
| -3.35200000000022 | 0.041 | 0.035 | 0.03 |
| -3.34800000000022 | 0.042 | 0.035 | 0.03 |
| -3.34400000000022 | 0.042 | 0.035 | 0.03 |
| -3.34000000000022 | 0.042 | 0.035 | 0.03 |
| -3.33600000000022 | 0.042 | 0.036 | 0.03 |
| -3.33200000000022 | 0.042 | 0.036 | 0.03 |
| -3.32800000000022 | 0.042 | 0.036 | 0.03 |
| -3.32400000000022 | 0.043 | 0.036 | 0.03 |
| -3.32000000000022 | 0.043 | 0.036 | 0.031 |
| -3.31600000000022 | 0.043 | 0.036 | 0.031 |
| -3.31200000000022 | 0.043 | 0.036 | 0.031 |
| -3.30800000000022 | 0.043 | 0.037 | 0.031 |
| -3.30400000000022 | 0.043 | 0.037 | 0.031 |
| -3.30000000000022 | 0.043 | 0.037 | 0.031 |
| -3.29600000000022 | 0.044 | 0.037 | 0.031 |
| -3.29200000000022 | 0.044 | 0.037 | 0.032 |
| -3.28800000000022 | 0.044 | 0.037 | 0.032 |
| -3.28400000000022 | 0.044 | 0.037 | 0.032 |
| -3.28000000000022 | 0.044 | 0.038 | 0.032 |
| -3.27600000000022 | 0.045 | 0.038 | 0.032 |
| -3.27200000000022 | 0.045 | 0.038 | 0.032 |
| -3.26800000000022 | 0.045 | 0.038 | 0.032 |
| -3.26400000000022 | 0.045 | 0.038 | 0.032 |
| -3.26000000000022 | 0.045 | 0.038 | 0.033 |
| -3.25600000000022 | 0.045 | 0.039 | 0.033 |
| -3.25200000000022 | 0.046 | 0.039 | 0.033 |
| -3.24800000000022 | 0.046 | 0.039 | 0.033 |
| -3.24400000000022 | 0.046 | 0.039 | 0.033 |
| -3.24000000000022 | 0.046 | 0.039 | 0.033 |
| -3.23600000000022 | 0.046 | 0.039 | 0.033 |
| -3.23200000000022 | 0.046 | 0.039 | 0.034 |
| -3.22800000000022 | 0.047 | 0.04 | 0.034 |
| -3.22400000000022 | 0.047 | 0.04 | 0.034 |
| -3.22000000000022 | 0.047 | 0.04 | 0.034 |
| -3.21600000000022 | 0.047 | 0.04 | 0.034 |
| -3.21200000000022 | 0.047 | 0.04 | 0.034 |
| -3.20800000000022 | 0.047 | 0.04 | 0.034 |
| -3.20400000000022 | 0.048 | 0.041 | 0.035 |
| -3.20000000000022 | 0.048 | 0.041 | 0.035 |
| -3.19600000000022 | 0.048 | 0.041 | 0.035 |
| -3.19200000000022 | 0.048 | 0.041 | 0.035 |
| -3.18800000000022 | 0.048 | 0.041 | 0.035 |
| -3.18400000000022 | 0.049 | 0.041 | 0.035 |
| -3.18000000000022 | 0.049 | 0.042 | 0.035 |
| -3.17600000000022 | 0.049 | 0.042 | 0.036 |
| -3.17200000000022 | 0.049 | 0.042 | 0.036 |
| -3.16800000000022 | 0.049 | 0.042 | 0.036 |
| -3.16400000000022 | 0.049 | 0.042 | 0.036 |
| -3.16000000000022 | 0.05 | 0.042 | 0.036 |
| -3.15600000000022 | 0.05 | 0.043 | 0.036 |
| -3.152000000000219 | 0.05 | 0.043 | 0.037 |
| -3.148000000000219 | 0.05 | 0.043 | 0.037 |
| -3.144000000000219 | 0.05 | 0.043 | 0.037 |
| -3.140000000000219 | 0.051 | 0.043 | 0.037 |
| -3.136000000000219 | 0.051 | 0.043 | 0.037 |
| -3.132000000000219 | 0.051 | 0.044 | 0.037 |
| -3.128000000000219 | 0.051 | 0.044 | 0.037 |
| -3.124000000000219 | 0.051 | 0.044 | 0.038 |
| -3.120000000000219 | 0.052 | 0.044 | 0.038 |
| -3.116000000000219 | 0.052 | 0.044 | 0.038 |
| -3.112000000000219 | 0.052 | 0.045 | 0.038 |
| -3.108000000000219 | 0.052 | 0.045 | 0.038 |
| -3.104000000000219 | 0.052 | 0.045 | 0.038 |
| -3.100000000000219 | 0.053 | 0.045 | 0.039 |
| -3.096000000000219 | 0.053 | 0.045 | 0.039 |
| -3.092000000000219 | 0.053 | 0.045 | 0.039 |
| -3.088000000000219 | 0.053 | 0.046 | 0.039 |
| -3.084000000000219 | 0.053 | 0.046 | 0.039 |
| -3.080000000000219 | 0.054 | 0.046 | 0.039 |
| -3.076000000000219 | 0.054 | 0.046 | 0.04 |
| -3.072000000000219 | 0.054 | 0.046 | 0.04 |
| -3.068000000000219 | 0.054 | 0.047 | 0.04 |
| -3.064000000000219 | 0.054 | 0.047 | 0.04 |
| -3.060000000000219 | 0.055 | 0.047 | 0.04 |
| -3.056000000000219 | 0.055 | 0.047 | 0.04 |
| -3.052000000000219 | 0.055 | 0.047 | 0.041 |
| -3.048000000000219 | 0.055 | 0.047 | 0.041 |
| -3.044000000000219 | 0.055 | 0.048 | 0.041 |
| -3.040000000000219 | 0.056 | 0.048 | 0.041 |
| -3.036000000000219 | 0.056 | 0.048 | 0.041 |
| -3.032000000000219 | 0.056 | 0.048 | 0.041 |
| -3.028000000000219 | 0.056 | 0.048 | 0.042 |
| -3.024000000000219 | 0.057 | 0.049 | 0.042 |
| -3.020000000000219 | 0.057 | 0.049 | 0.042 |
| -3.016000000000219 | 0.057 | 0.049 | 0.042 |
| -3.012000000000219 | 0.057 | 0.049 | 0.042 |
| -3.008000000000219 | 0.057 | 0.049 | 0.042 |
| -3.004000000000219 | 0.058 | 0.05 | 0.043 |
| -3.000000000000219 | 0.058 | 0.05 | 0.043 |
| -2.996000000000219 | 0.058 | 0.05 | 0.043 |
| -2.992000000000219 | 0.058 | 0.05 | 0.043 |
| -2.988000000000219 | 0.059 | 0.05 | 0.043 |
| -2.984000000000219 | 0.059 | 0.051 | 0.044 |
| -2.980000000000219 | 0.059 | 0.051 | 0.044 |
| -2.976000000000219 | 0.059 | 0.051 | 0.044 |
| -2.972000000000219 | 0.059 | 0.051 | 0.044 |
| -2.968000000000219 | 0.06 | 0.051 | 0.044 |
| -2.964000000000219 | 0.06 | 0.052 | 0.045 |
| -2.960000000000219 | 0.06 | 0.052 | 0.045 |
| -2.956000000000219 | 0.06 | 0.052 | 0.045 |
| -2.952000000000219 | 0.061 | 0.052 | 0.045 |
| -2.948000000000219 | 0.061 | 0.052 | 0.045 |
| -2.944000000000219 | 0.061 | 0.053 | 0.045 |
| -2.940000000000219 | 0.061 | 0.053 | 0.046 |
| -2.936000000000219 | 0.061 | 0.053 | 0.046 |
| -2.932000000000219 | 0.062 | 0.053 | 0.046 |
| -2.928000000000219 | 0.062 | 0.054 | 0.046 |
| -2.924000000000219 | 0.062 | 0.054 | 0.046 |
| -2.920000000000219 | 0.062 | 0.054 | 0.047 |
| -2.916000000000219 | 0.063 | 0.054 | 0.047 |
| -2.912000000000219 | 0.063 | 0.054 | 0.047 |
| -2.908000000000219 | 0.063 | 0.055 | 0.047 |
| -2.904000000000219 | 0.063 | 0.055 | 0.047 |
| -2.900000000000219 | 0.064 | 0.055 | 0.048 |
| -2.896000000000219 | 0.064 | 0.055 | 0.048 |
| -2.892000000000219 | 0.064 | 0.055 | 0.048 |
| -2.888000000000219 | 0.064 | 0.056 | 0.048 |
| -2.884000000000219 | 0.065 | 0.056 | 0.048 |
| -2.880000000000219 | 0.065 | 0.056 | 0.049 |
| -2.876000000000219 | 0.065 | 0.056 | 0.049 |
| -2.872000000000219 | 0.065 | 0.057 | 0.049 |
| -2.868000000000219 | 0.066 | 0.057 | 0.049 |
| -2.864000000000219 | 0.066 | 0.057 | 0.049 |
| -2.860000000000219 | 0.066 | 0.057 | 0.05 |
| -2.856000000000219 | 0.066 | 0.057 | 0.05 |
| -2.852000000000219 | 0.067 | 0.058 | 0.05 |
| -2.848000000000219 | 0.067 | 0.058 | 0.05 |
| -2.844000000000219 | 0.067 | 0.058 | 0.05 |
| -2.840000000000219 | 0.067 | 0.058 | 0.051 |
| -2.836000000000219 | 0.068 | 0.059 | 0.051 |
| -2.832000000000219 | 0.068 | 0.059 | 0.051 |
| -2.828000000000219 | 0.068 | 0.059 | 0.051 |
| -2.824000000000219 | 0.068 | 0.059 | 0.052 |
| -2.820000000000219 | 0.069 | 0.06 | 0.052 |
| -2.816000000000219 | 0.069 | 0.06 | 0.052 |
| -2.812000000000219 | 0.069 | 0.06 | 0.052 |
| -2.808000000000219 | 0.069 | 0.06 | 0.052 |
| -2.804000000000219 | 0.07 | 0.061 | 0.053 |
| -2.800000000000219 | 0.07 | 0.061 | 0.053 |
| -2.796000000000219 | 0.07 | 0.061 | 0.053 |
| -2.792000000000219 | 0.07 | 0.061 | 0.053 |
| -2.78800000000022 | 0.071 | 0.062 | 0.054 |
| -2.78400000000022 | 0.071 | 0.062 | 0.054 |
| -2.78000000000022 | 0.071 | 0.062 | 0.054 |
| -2.776000000000219 | 0.072 | 0.062 | 0.054 |
| -2.772000000000219 | 0.072 | 0.063 | 0.054 |
| -2.76800000000022 | 0.072 | 0.063 | 0.055 |
| -2.76400000000022 | 0.072 | 0.063 | 0.055 |
| -2.76000000000022 | 0.073 | 0.063 | 0.055 |
| -2.756000000000219 | 0.073 | 0.064 | 0.055 |
| -2.752000000000219 | 0.073 | 0.064 | 0.056 |
| -2.74800000000022 | 0.073 | 0.064 | 0.056 |
| -2.74400000000022 | 0.074 | 0.064 | 0.056 |
| -2.74000000000022 | 0.074 | 0.065 | 0.056 |
| -2.736000000000219 | 0.074 | 0.065 | 0.057 |
| -2.732000000000219 | 0.075 | 0.065 | 0.057 |
| -2.72800000000022 | 0.075 | 0.065 | 0.057 |
| -2.72400000000022 | 0.075 | 0.066 | 0.057 |
| -2.72000000000022 | 0.075 | 0.066 | 0.057 |
| -2.716000000000219 | 0.076 | 0.066 | 0.058 |
| -2.712000000000219 | 0.076 | 0.066 | 0.058 |
| -2.70800000000022 | 0.076 | 0.067 | 0.058 |
| -2.70400000000022 | 0.077 | 0.067 | 0.058 |
| -2.70000000000022 | 0.077 | 0.067 | 0.059 |
| -2.696000000000219 | 0.077 | 0.067 | 0.059 |
| -2.692000000000219 | 0.078 | 0.068 | 0.059 |
| -2.688000000000219 | 0.078 | 0.068 | 0.059 |
| -2.684000000000219 | 0.078 | 0.068 | 0.06 |
| -2.680000000000219 | 0.078 | 0.069 | 0.06 |
| -2.676000000000219 | 0.079 | 0.069 | 0.06 |
| -2.672000000000219 | 0.079 | 0.069 | 0.06 |
| -2.668000000000219 | 0.079 | 0.069 | 0.061 |
| -2.664000000000219 | 0.08 | 0.07 | 0.061 |
| -2.660000000000219 | 0.08 | 0.07 | 0.061 |
| -2.656000000000219 | 0.08 | 0.07 | 0.061 |
| -2.652000000000219 | 0.081 | 0.071 | 0.062 |
| -2.648000000000219 | 0.081 | 0.071 | 0.062 |
| -2.644000000000219 | 0.081 | 0.071 | 0.062 |
| -2.640000000000219 | 0.081 | 0.071 | 0.063 |
| -2.636000000000219 | 0.082 | 0.072 | 0.063 |
| -2.632000000000219 | 0.082 | 0.072 | 0.063 |
| -2.628000000000219 | 0.082 | 0.072 | 0.063 |
| -2.624000000000219 | 0.083 | 0.073 | 0.064 |
| -2.620000000000219 | 0.083 | 0.073 | 0.064 |
| -2.616000000000219 | 0.083 | 0.073 | 0.064 |
| -2.612000000000219 | 0.084 | 0.073 | 0.064 |
| -2.608000000000219 | 0.084 | 0.074 | 0.065 |
| -2.604000000000219 | 0.084 | 0.074 | 0.065 |
| -2.600000000000219 | 0.085 | 0.074 | 0.065 |
| -2.596000000000219 | 0.085 | 0.075 | 0.065 |
| -2.592000000000219 | 0.085 | 0.075 | 0.066 |
| -2.588000000000219 | 0.086 | 0.075 | 0.066 |
| -2.584000000000219 | 0.086 | 0.075 | 0.066 |
| -2.580000000000219 | 0.086 | 0.076 | 0.067 |
| -2.576000000000219 | 0.087 | 0.076 | 0.067 |
| -2.572000000000219 | 0.087 | 0.076 | 0.067 |
| -2.568000000000219 | 0.087 | 0.077 | 0.067 |
| -2.564000000000219 | 0.088 | 0.077 | 0.068 |
| -2.560000000000219 | 0.088 | 0.077 | 0.068 |
| -2.556000000000219 | 0.088 | 0.078 | 0.068 |
| -2.552000000000219 | 0.089 | 0.078 | 0.069 |
| -2.548000000000219 | 0.089 | 0.078 | 0.069 |
| -2.544000000000219 | 0.089 | 0.079 | 0.069 |
| -2.540000000000219 | 0.09 | 0.079 | 0.069 |
| -2.536000000000219 | 0.09 | 0.079 | 0.07 |
| -2.532000000000219 | 0.09 | 0.079 | 0.07 |
| -2.528000000000219 | 0.091 | 0.08 | 0.07 |
| -2.524000000000219 | 0.091 | 0.08 | 0.071 |
| -2.520000000000219 | 0.091 | 0.08 | 0.071 |
| -2.516000000000219 | 0.092 | 0.081 | 0.071 |
| -2.512000000000219 | 0.092 | 0.081 | 0.072 |
| -2.508000000000219 | 0.092 | 0.081 | 0.072 |
| -2.504000000000219 | 0.093 | 0.082 | 0.072 |
| -2.500000000000219 | 0.093 | 0.082 | 0.072 |
| -2.496000000000219 | 0.093 | 0.082 | 0.073 |
| -2.492000000000219 | 0.094 | 0.083 | 0.073 |
| -2.488000000000219 | 0.094 | 0.083 | 0.073 |
| -2.484000000000219 | 0.094 | 0.083 | 0.074 |
| -2.480000000000219 | 0.095 | 0.084 | 0.074 |
| -2.476000000000219 | 0.095 | 0.084 | 0.074 |
| -2.472000000000219 | 0.096 | 0.084 | 0.075 |
| -2.468000000000219 | 0.096 | 0.085 | 0.075 |
| -2.464000000000219 | 0.096 | 0.085 | 0.075 |
| -2.460000000000219 | 0.097 | 0.085 | 0.076 |
| -2.456000000000219 | 0.097 | 0.086 | 0.076 |
| -2.452000000000219 | 0.097 | 0.086 | 0.076 |
| -2.448000000000219 | 0.098 | 0.086 | 0.077 |
| -2.444000000000219 | 0.098 | 0.087 | 0.077 |
| -2.440000000000219 | 0.098 | 0.087 | 0.077 |
| -2.436000000000219 | 0.099 | 0.088 | 0.077 |
| -2.432000000000219 | 0.099 | 0.088 | 0.078 |
| -2.428000000000219 | 0.1 | 0.088 | 0.078 |
| -2.424000000000219 | 0.1 | 0.089 | 0.078 |
| -2.420000000000219 | 0.1 | 0.089 | 0.079 |
| -2.416000000000219 | 0.101 | 0.089 | 0.079 |
| -2.412000000000219 | 0.101 | 0.09 | 0.079 |
| -2.408000000000219 | 0.102 | 0.09 | 0.08 |
| -2.404000000000219 | 0.102 | 0.09 | 0.08 |
| -2.400000000000219 | 0.102 | 0.091 | 0.08 |
| -2.396000000000219 | 0.103 | 0.091 | 0.081 |
| -2.392000000000219 | 0.103 | 0.091 | 0.081 |
| -2.388000000000219 | 0.103 | 0.092 | 0.081 |
| -2.384000000000219 | 0.104 | 0.092 | 0.082 |
| -2.380000000000219 | 0.104 | 0.093 | 0.082 |
| -2.376000000000219 | 0.105 | 0.093 | 0.083 |
| -2.372000000000219 | 0.105 | 0.093 | 0.083 |
| -2.368000000000219 | 0.105 | 0.094 | 0.083 |
| -2.364000000000219 | 0.106 | 0.094 | 0.084 |
| -2.360000000000219 | 0.106 | 0.094 | 0.084 |
| -2.356000000000219 | 0.107 | 0.095 | 0.084 |
| -2.352000000000219 | 0.107 | 0.095 | 0.085 |
| -2.348000000000219 | 0.107 | 0.096 | 0.085 |
| -2.344000000000219 | 0.108 | 0.096 | 0.085 |
| -2.340000000000219 | 0.108 | 0.096 | 0.086 |
| -2.336000000000219 | 0.109 | 0.097 | 0.086 |
| -2.332000000000219 | 0.109 | 0.097 | 0.086 |
| -2.328000000000219 | 0.11 | 0.097 | 0.087 |
| -2.324000000000219 | 0.11 | 0.098 | 0.087 |
| -2.320000000000219 | 0.11 | 0.098 | 0.088 |
| -2.316000000000219 | 0.111 | 0.099 | 0.088 |
| -2.312000000000219 | 0.111 | 0.099 | 0.088 |
| -2.308000000000219 | 0.112 | 0.099 | 0.089 |
| -2.304000000000219 | 0.112 | 0.1 | 0.089 |
| -2.300000000000219 | 0.112 | 0.1 | 0.089 |
| -2.296000000000219 | 0.113 | 0.101 | 0.09 |
| -2.292000000000219 | 0.113 | 0.101 | 0.09 |
| -2.288000000000219 | 0.114 | 0.101 | 0.091 |
| -2.284000000000219 | 0.114 | 0.102 | 0.091 |
| -2.280000000000219 | 0.115 | 0.102 | 0.091 |
| -2.276000000000219 | 0.115 | 0.103 | 0.092 |
| -2.272000000000219 | 0.116 | 0.103 | 0.092 |
| -2.268000000000219 | 0.116 | 0.104 | 0.092 |
| -2.264000000000219 | 0.116 | 0.104 | 0.093 |
| -2.260000000000219 | 0.117 | 0.104 | 0.093 |
| -2.256000000000219 | 0.117 | 0.105 | 0.094 |
| -2.252000000000219 | 0.118 | 0.105 | 0.094 |
| -2.248000000000219 | 0.118 | 0.106 | 0.094 |
| -2.244000000000219 | 0.119 | 0.106 | 0.095 |
| -2.240000000000219 | 0.119 | 0.106 | 0.095 |
| -2.236000000000219 | 0.12 | 0.107 | 0.096 |
| -2.232000000000219 | 0.12 | 0.107 | 0.096 |
| -2.228000000000219 | 0.12 | 0.108 | 0.096 |
| -2.224000000000219 | 0.121 | 0.108 | 0.097 |
| -2.220000000000219 | 0.121 | 0.109 | 0.097 |
| -2.216000000000219 | 0.122 | 0.109 | 0.098 |
| -2.212000000000219 | 0.122 | 0.109 | 0.098 |
| -2.208000000000219 | 0.123 | 0.11 | 0.098 |
| -2.204000000000219 | 0.123 | 0.11 | 0.099 |
| -2.200000000000219 | 0.124 | 0.111 | 0.099 |
| -2.196000000000219 | 0.124 | 0.111 | 0.1 |
| -2.192000000000219 | 0.125 | 0.112 | 0.1 |
| -2.188000000000219 | 0.125 | 0.112 | 0.101 |
| -2.184000000000219 | 0.126 | 0.113 | 0.101 |
| -2.180000000000219 | 0.126 | 0.113 | 0.101 |
| -2.176000000000219 | 0.127 | 0.113 | 0.102 |
| -2.172000000000219 | 0.127 | 0.114 | 0.102 |
| -2.168000000000219 | 0.128 | 0.114 | 0.103 |
| -2.164000000000219 | 0.128 | 0.115 | 0.103 |
| -2.160000000000219 | 0.128 | 0.115 | 0.104 |
| -2.156000000000219 | 0.129 | 0.116 | 0.104 |
| -2.152000000000219 | 0.129 | 0.116 | 0.104 |
| -2.148000000000219 | 0.13 | 0.117 | 0.105 |
| -2.144000000000219 | 0.13 | 0.117 | 0.105 |
| -2.140000000000219 | 0.131 | 0.118 | 0.106 |
| -2.136000000000219 | 0.131 | 0.118 | 0.106 |
| -2.132000000000219 | 0.132 | 0.119 | 0.107 |
| -2.128000000000219 | 0.132 | 0.119 | 0.107 |
| -2.124000000000219 | 0.133 | 0.12 | 0.108 |
| -2.120000000000219 | 0.133 | 0.12 | 0.108 |
| -2.116000000000219 | 0.134 | 0.121 | 0.108 |
| -2.112000000000219 | 0.134 | 0.121 | 0.109 |
| -2.108000000000219 | 0.135 | 0.121 | 0.109 |
| -2.104000000000219 | 0.135 | 0.122 | 0.11 |
| -2.100000000000219 | 0.136 | 0.122 | 0.11 |
| -2.096000000000219 | 0.137 | 0.123 | 0.111 |
| -2.092000000000219 | 0.137 | 0.123 | 0.111 |
| -2.088000000000219 | 0.138 | 0.124 | 0.112 |
| -2.084000000000219 | 0.138 | 0.124 | 0.112 |
| -2.080000000000219 | 0.139 | 0.125 | 0.113 |
| -2.076000000000219 | 0.139 | 0.125 | 0.113 |
| -2.072000000000219 | 0.14 | 0.126 | 0.114 |
| -2.068000000000219 | 0.14 | 0.126 | 0.114 |
| -2.064000000000219 | 0.141 | 0.127 | 0.114 |
| -2.060000000000219 | 0.141 | 0.127 | 0.115 |
| -2.056000000000219 | 0.142 | 0.128 | 0.115 |
| -2.052000000000219 | 0.142 | 0.128 | 0.116 |
| -2.048000000000219 | 0.143 | 0.129 | 0.116 |
| -2.044000000000219 | 0.143 | 0.13 | 0.117 |
| -2.040000000000219 | 0.144 | 0.13 | 0.117 |
| -2.036000000000219 | 0.145 | 0.131 | 0.118 |
| -2.032000000000219 | 0.145 | 0.131 | 0.118 |
| -2.028000000000219 | 0.146 | 0.132 | 0.119 |
| -2.024000000000219 | 0.146 | 0.132 | 0.119 |
| -2.020000000000219 | 0.147 | 0.133 | 0.12 |
| -2.016000000000219 | 0.147 | 0.133 | 0.12 |
| -2.012000000000219 | 0.148 | 0.134 | 0.121 |
| -2.008000000000218 | 0.148 | 0.134 | 0.121 |
| -2.004000000000218 | 0.149 | 0.135 | 0.122 |
| -2.000000000000218 | 0.15 | 0.135 | 0.122 |
| -1.996000000000218 | 0.15 | 0.136 | 0.123 |
| -1.992000000000218 | 0.151 | 0.136 | 0.123 |
| -1.988000000000218 | 0.151 | 0.137 | 0.124 |
| -1.984000000000218 | 0.152 | 0.138 | 0.125 |
| -1.980000000000218 | 0.152 | 0.138 | 0.125 |
| -1.976000000000218 | 0.153 | 0.139 | 0.126 |
| -1.972000000000218 | 0.154 | 0.139 | 0.126 |
| -1.968000000000218 | 0.154 | 0.14 | 0.127 |
| -1.964000000000218 | 0.155 | 0.14 | 0.127 |
| -1.960000000000218 | 0.155 | 0.141 | 0.128 |
| -1.956000000000218 | 0.156 | 0.141 | 0.128 |
| -1.952000000000218 | 0.157 | 0.142 | 0.129 |
| -1.948000000000218 | 0.157 | 0.143 | 0.129 |
| -1.944000000000218 | 0.158 | 0.143 | 0.13 |
| -1.940000000000218 | 0.158 | 0.144 | 0.13 |
| -1.936000000000218 | 0.159 | 0.144 | 0.131 |
| -1.932000000000218 | 0.16 | 0.145 | 0.132 |
| -1.928000000000218 | 0.16 | 0.145 | 0.132 |
| -1.924000000000218 | 0.161 | 0.146 | 0.133 |
| -1.920000000000218 | 0.161 | 0.147 | 0.133 |
| -1.916000000000218 | 0.162 | 0.147 | 0.134 |
| -1.912000000000218 | 0.163 | 0.148 | 0.134 |
| -1.908000000000218 | 0.163 | 0.148 | 0.135 |
| -1.904000000000218 | 0.164 | 0.149 | 0.135 |
| -1.900000000000218 | 0.164 | 0.15 | 0.136 |
| -1.896000000000218 | 0.165 | 0.15 | 0.137 |
| -1.892000000000218 | 0.166 | 0.151 | 0.137 |
| -1.888000000000218 | 0.166 | 0.151 | 0.138 |
| -1.884000000000218 | 0.167 | 0.152 | 0.138 |
| -1.880000000000218 | 0.168 | 0.153 | 0.139 |
| -1.876000000000218 | 0.168 | 0.153 | 0.139 |
| -1.872000000000218 | 0.169 | 0.154 | 0.14 |
| -1.868000000000218 | 0.17 | 0.154 | 0.141 |
| -1.864000000000218 | 0.17 | 0.155 | 0.141 |
| -1.860000000000218 | 0.171 | 0.156 | 0.142 |
| -1.856000000000218 | 0.171 | 0.156 | 0.142 |
| -1.852000000000218 | 0.172 | 0.157 | 0.143 |
| -1.848000000000218 | 0.173 | 0.158 | 0.144 |
| -1.844000000000218 | 0.173 | 0.158 | 0.144 |
| -1.840000000000218 | 0.174 | 0.159 | 0.145 |
| -1.836000000000218 | 0.175 | 0.159 | 0.145 |
| -1.832000000000218 | 0.175 | 0.16 | 0.146 |
| -1.828000000000218 | 0.176 | 0.161 | 0.147 |
| -1.824000000000218 | 0.177 | 0.161 | 0.147 |
| -1.820000000000218 | 0.177 | 0.162 | 0.148 |
| -1.816000000000218 | 0.178 | 0.163 | 0.149 |
| -1.812000000000218 | 0.179 | 0.163 | 0.149 |
| -1.808000000000218 | 0.179 | 0.164 | 0.15 |
| -1.804000000000218 | 0.18 | 0.165 | 0.15 |
| -1.800000000000218 | 0.181 | 0.165 | 0.151 |
| -1.796000000000218 | 0.182 | 0.166 | 0.152 |
| -1.792000000000218 | 0.182 | 0.167 | 0.152 |
| -1.788000000000218 | 0.183 | 0.167 | 0.153 |
| -1.784000000000218 | 0.184 | 0.168 | 0.154 |
| -1.780000000000218 | 0.184 | 0.169 | 0.154 |
| -1.776000000000218 | 0.185 | 0.169 | 0.155 |
| -1.772000000000218 | 0.186 | 0.17 | 0.156 |
| -1.768000000000218 | 0.186 | 0.171 | 0.156 |
| -1.764000000000218 | 0.187 | 0.171 | 0.157 |
| -1.760000000000218 | 0.188 | 0.172 | 0.158 |
| -1.756000000000218 | 0.189 | 0.173 | 0.158 |
| -1.752000000000218 | 0.189 | 0.173 | 0.159 |
| -1.748000000000218 | 0.19 | 0.174 | 0.16 |
| -1.744000000000218 | 0.191 | 0.175 | 0.16 |
| -1.740000000000218 | 0.191 | 0.176 | 0.161 |
| -1.736000000000218 | 0.192 | 0.176 | 0.162 |
| -1.732000000000218 | 0.193 | 0.177 | 0.162 |
| -1.728000000000218 | 0.194 | 0.178 | 0.163 |
| -1.724000000000218 | 0.194 | 0.178 | 0.164 |
| -1.720000000000218 | 0.195 | 0.179 | 0.164 |
| -1.716000000000218 | 0.196 | 0.18 | 0.165 |
| -1.712000000000218 | 0.197 | 0.181 | 0.166 |
| -1.708000000000218 | 0.197 | 0.181 | 0.166 |
| -1.704000000000218 | 0.198 | 0.182 | 0.167 |
| -1.700000000000218 | 0.199 | 0.183 | 0.168 |
| -1.696000000000218 | 0.2 | 0.183 | 0.169 |
| -1.692000000000218 | 0.2 | 0.184 | 0.169 |
| -1.688000000000218 | 0.201 | 0.185 | 0.17 |
| -1.684000000000218 | 0.202 | 0.186 | 0.171 |
| -1.680000000000218 | 0.203 | 0.186 | 0.171 |
| -1.676000000000218 | 0.203 | 0.187 | 0.172 |
| -1.672000000000218 | 0.204 | 0.188 | 0.173 |
| -1.668000000000218 | 0.205 | 0.189 | 0.174 |
| -1.664000000000218 | 0.206 | 0.189 | 0.174 |
| -1.660000000000218 | 0.207 | 0.19 | 0.175 |
| -1.656000000000218 | 0.207 | 0.191 | 0.176 |
| -1.652000000000218 | 0.208 | 0.192 | 0.176 |
| -1.648000000000218 | 0.209 | 0.192 | 0.177 |
| -1.644000000000218 | 0.21 | 0.193 | 0.178 |
| -1.640000000000218 | 0.211 | 0.194 | 0.179 |
| -1.636000000000218 | 0.211 | 0.195 | 0.179 |
| -1.632000000000218 | 0.212 | 0.196 | 0.18 |
| -1.628000000000218 | 0.213 | 0.196 | 0.181 |
| -1.624000000000218 | 0.214 | 0.197 | 0.182 |
| -1.620000000000218 | 0.215 | 0.198 | 0.183 |
| -1.616000000000218 | 0.215 | 0.199 | 0.183 |
| -1.612000000000218 | 0.216 | 0.199 | 0.184 |
| -1.608000000000218 | 0.217 | 0.2 | 0.185 |
| -1.604000000000218 | 0.218 | 0.201 | 0.186 |
| -1.600000000000218 | 0.219 | 0.202 | 0.186 |
| -1.596000000000218 | 0.22 | 0.203 | 0.187 |
| -1.592000000000218 | 0.22 | 0.204 | 0.188 |
| -1.588000000000218 | 0.221 | 0.204 | 0.189 |
| -1.584000000000218 | 0.222 | 0.205 | 0.19 |
| -1.580000000000218 | 0.223 | 0.206 | 0.19 |
| -1.576000000000218 | 0.224 | 0.207 | 0.191 |
| -1.572000000000218 | 0.225 | 0.208 | 0.192 |
| -1.568000000000218 | 0.225 | 0.208 | 0.193 |
| -1.564000000000218 | 0.226 | 0.209 | 0.194 |
| -1.560000000000218 | 0.227 | 0.21 | 0.194 |
| -1.556000000000218 | 0.228 | 0.211 | 0.195 |
| -1.552000000000218 | 0.229 | 0.212 | 0.196 |
| -1.548000000000218 | 0.23 | 0.213 | 0.197 |
| -1.544000000000218 | 0.231 | 0.214 | 0.198 |
| -1.540000000000218 | 0.232 | 0.214 | 0.198 |
| -1.536000000000218 | 0.232 | 0.215 | 0.199 |
| -1.532000000000218 | 0.233 | 0.216 | 0.2 |
| -1.528000000000218 | 0.234 | 0.217 | 0.201 |
| -1.524000000000218 | 0.235 | 0.218 | 0.202 |
| -1.520000000000218 | 0.236 | 0.219 | 0.203 |
| -1.516000000000218 | 0.237 | 0.22 | 0.204 |
| -1.512000000000218 | 0.238 | 0.22 | 0.204 |
| -1.508000000000218 | 0.239 | 0.221 | 0.205 |
| -1.504000000000218 | 0.24 | 0.222 | 0.206 |
| -1.500000000000218 | 0.241 | 0.223 | 0.207 |
| -1.496000000000218 | 0.241 | 0.224 | 0.208 |
| -1.492000000000218 | 0.242 | 0.225 | 0.209 |
| -1.488000000000218 | 0.243 | 0.226 | 0.21 |
| -1.484000000000218 | 0.244 | 0.227 | 0.211 |
| -1.480000000000218 | 0.245 | 0.228 | 0.211 |
| -1.476000000000218 | 0.246 | 0.229 | 0.212 |
| -1.472000000000218 | 0.247 | 0.229 | 0.213 |
| -1.468000000000218 | 0.248 | 0.23 | 0.214 |
| -1.464000000000218 | 0.249 | 0.231 | 0.215 |
| -1.460000000000218 | 0.25 | 0.232 | 0.216 |
| -1.456000000000218 | 0.251 | 0.233 | 0.217 |
| -1.452000000000218 | 0.252 | 0.234 | 0.218 |
| -1.448000000000218 | 0.253 | 0.235 | 0.219 |
| -1.444000000000218 | 0.254 | 0.236 | 0.22 |
| -1.440000000000218 | 0.255 | 0.237 | 0.22 |
| -1.436000000000218 | 0.256 | 0.238 | 0.221 |
| -1.432000000000218 | 0.257 | 0.239 | 0.222 |
| -1.428000000000218 | 0.258 | 0.24 | 0.223 |
| -1.424000000000218 | 0.259 | 0.241 | 0.224 |
| -1.420000000000218 | 0.259 | 0.242 | 0.225 |
| -1.416000000000218 | 0.26 | 0.243 | 0.226 |
| -1.412000000000218 | 0.261 | 0.244 | 0.227 |
| -1.408000000000218 | 0.262 | 0.245 | 0.228 |
| -1.404000000000218 | 0.263 | 0.246 | 0.229 |
| -1.400000000000218 | 0.264 | 0.247 | 0.23 |
| -1.396000000000218 | 0.265 | 0.248 | 0.231 |
| -1.392000000000218 | 0.266 | 0.249 | 0.232 |
| -1.388000000000218 | 0.268 | 0.25 | 0.233 |
| -1.384000000000218 | 0.269 | 0.251 | 0.234 |
| -1.380000000000218 | 0.27 | 0.252 | 0.235 |
| -1.376000000000218 | 0.271 | 0.253 | 0.236 |
| -1.372000000000218 | 0.272 | 0.254 | 0.237 |
| -1.368000000000218 | 0.273 | 0.255 | 0.238 |
| -1.364000000000218 | 0.274 | 0.256 | 0.239 |
| -1.360000000000218 | 0.275 | 0.257 | 0.24 |
| -1.356000000000218 | 0.276 | 0.258 | 0.241 |
| -1.352000000000218 | 0.277 | 0.259 | 0.242 |
| -1.348000000000218 | 0.278 | 0.26 | 0.243 |
| -1.344000000000218 | 0.279 | 0.261 | 0.244 |
| -1.340000000000218 | 0.28 | 0.262 | 0.245 |
| -1.336000000000218 | 0.281 | 0.263 | 0.246 |
| -1.332000000000218 | 0.282 | 0.264 | 0.247 |
| -1.328000000000218 | 0.283 | 0.265 | 0.248 |
| -1.324000000000218 | 0.284 | 0.266 | 0.249 |
| -1.320000000000218 | 0.285 | 0.267 | 0.25 |
| -1.316000000000218 | 0.286 | 0.268 | 0.251 |
| -1.312000000000218 | 0.288 | 0.269 | 0.252 |
| -1.308000000000218 | 0.289 | 0.27 | 0.253 |
| -1.304000000000218 | 0.29 | 0.271 | 0.254 |
| -1.300000000000218 | 0.291 | 0.273 | 0.255 |
| -1.296000000000218 | 0.292 | 0.274 | 0.256 |
| -1.292000000000218 | 0.293 | 0.275 | 0.258 |
| -1.288000000000218 | 0.294 | 0.276 | 0.259 |
| -1.284000000000218 | 0.295 | 0.277 | 0.26 |
| -1.280000000000218 | 0.296 | 0.278 | 0.261 |
| -1.276000000000218 | 0.298 | 0.279 | 0.262 |
| -1.272000000000218 | 0.299 | 0.28 | 0.263 |
| -1.268000000000218 | 0.3 | 0.281 | 0.264 |
| -1.264000000000218 | 0.301 | 0.283 | 0.265 |
| -1.260000000000218 | 0.302 | 0.284 | 0.266 |
| -1.256000000000218 | 0.303 | 0.285 | 0.267 |
| -1.252000000000218 | 0.304 | 0.286 | 0.269 |
| -1.248000000000218 | 0.306 | 0.287 | 0.27 |
| -1.244000000000218 | 0.307 | 0.288 | 0.271 |
| -1.240000000000218 | 0.308 | 0.289 | 0.272 |
| -1.236000000000218 | 0.309 | 0.291 | 0.273 |
| -1.232000000000218 | 0.31 | 0.292 | 0.274 |
| -1.228000000000218 | 0.311 | 0.293 | 0.275 |
| -1.224000000000218 | 0.313 | 0.294 | 0.277 |
| -1.220000000000218 | 0.314 | 0.295 | 0.278 |
| -1.216000000000218 | 0.315 | 0.296 | 0.279 |
| -1.212000000000218 | 0.316 | 0.298 | 0.28 |
| -1.208000000000218 | 0.317 | 0.299 | 0.281 |
| -1.204000000000218 | 0.319 | 0.3 | 0.282 |
| -1.200000000000218 | 0.32 | 0.301 | 0.284 |
| -1.196000000000218 | 0.321 | 0.302 | 0.285 |
| -1.192000000000218 | 0.322 | 0.304 | 0.286 |
| -1.188000000000218 | 0.323 | 0.305 | 0.287 |
| -1.184000000000218 | 0.325 | 0.306 | 0.288 |
| -1.180000000000218 | 0.326 | 0.307 | 0.29 |
| -1.176000000000218 | 0.327 | 0.309 | 0.291 |
| -1.172000000000218 | 0.328 | 0.31 | 0.292 |
| -1.168000000000218 | 0.33 | 0.311 | 0.293 |
| -1.164000000000218 | 0.331 | 0.312 | 0.295 |
| -1.160000000000218 | 0.332 | 0.313 | 0.296 |
| -1.156000000000218 | 0.333 | 0.315 | 0.297 |
| -1.152000000000218 | 0.335 | 0.316 | 0.298 |
| -1.148000000000218 | 0.336 | 0.317 | 0.3 |
| -1.144000000000218 | 0.337 | 0.319 | 0.301 |
| -1.140000000000218 | 0.339 | 0.32 | 0.302 |
| -1.136000000000218 | 0.34 | 0.321 | 0.303 |
| -1.132000000000218 | 0.341 | 0.322 | 0.305 |
| -1.128000000000218 | 0.342 | 0.324 | 0.306 |
| -1.124000000000218 | 0.344 | 0.325 | 0.307 |
| -1.120000000000218 | 0.345 | 0.326 | 0.309 |
| -1.116000000000218 | 0.346 | 0.328 | 0.31 |
| -1.112000000000218 | 0.348 | 0.329 | 0.311 |
| -1.108000000000218 | 0.349 | 0.33 | 0.312 |
| -1.104000000000218 | 0.35 | 0.332 | 0.314 |
| -1.100000000000218 | 0.352 | 0.333 | 0.315 |
| -1.096000000000218 | 0.353 | 0.334 | 0.316 |
| -1.092000000000218 | 0.354 | 0.336 | 0.318 |
| -1.088000000000218 | 0.356 | 0.337 | 0.319 |
| -1.084000000000218 | 0.357 | 0.338 | 0.32 |
| -1.080000000000218 | 0.358 | 0.34 | 0.322 |
| -1.076000000000218 | 0.36 | 0.341 | 0.323 |
| -1.072000000000218 | 0.361 | 0.342 | 0.324 |
| -1.068000000000218 | 0.363 | 0.344 | 0.326 |
| -1.064000000000218 | 0.364 | 0.345 | 0.327 |
| -1.060000000000218 | 0.365 | 0.346 | 0.329 |
| -1.056000000000218 | 0.367 | 0.348 | 0.33 |
| -1.052000000000218 | 0.368 | 0.349 | 0.331 |
| -1.048000000000218 | 0.37 | 0.351 | 0.333 |
| -1.044000000000218 | 0.371 | 0.352 | 0.334 |
| -1.040000000000218 | 0.372 | 0.353 | 0.336 |
| -1.036000000000218 | 0.374 | 0.355 | 0.337 |
| -1.032000000000218 | 0.375 | 0.356 | 0.338 |
| -1.028000000000218 | 0.377 | 0.358 | 0.34 |
| -1.024000000000218 | 0.378 | 0.359 | 0.341 |
| -1.020000000000218 | 0.379 | 0.361 | 0.343 |
| -1.016000000000218 | 0.381 | 0.362 | 0.344 |
| -1.012000000000218 | 0.382 | 0.363 | 0.346 |
| -1.008000000000218 | 0.384 | 0.365 | 0.347 |
| -1.004000000000218 | 0.385 | 0.366 | 0.348 |
| -1.000000000000218 | 0.387 | 0.368 | 0.35 |
| -0.996000000000218 | 0.388 | 0.369 | 0.351 |
| -0.992000000000218 | 0.39 | 0.371 | 0.353 |
| -0.988000000000218 | 0.391 | 0.372 | 0.354 |
| -0.984000000000218 | 0.393 | 0.374 | 0.356 |
| -0.980000000000218 | 0.394 | 0.375 | 0.357 |
| -0.976000000000218 | 0.396 | 0.377 | 0.359 |
| -0.972000000000218 | 0.397 | 0.378 | 0.36 |
| -0.968000000000218 | 0.399 | 0.38 | 0.362 |
| -0.964000000000218 | 0.4 | 0.381 | 0.363 |
| -0.960000000000218 | 0.402 | 0.383 | 0.365 |
| -0.956000000000218 | 0.403 | 0.384 | 0.366 |
| -0.952000000000218 | 0.405 | 0.386 | 0.368 |
| -0.948000000000218 | 0.406 | 0.388 | 0.37 |
| -0.944000000000218 | 0.408 | 0.389 | 0.371 |
| -0.940000000000218 | 0.409 | 0.391 | 0.373 |
| -0.936000000000218 | 0.411 | 0.392 | 0.374 |
| -0.932000000000218 | 0.413 | 0.394 | 0.376 |
| -0.928000000000218 | 0.414 | 0.395 | 0.377 |
| -0.924000000000218 | 0.416 | 0.397 | 0.379 |
| -0.920000000000218 | 0.417 | 0.399 | 0.381 |
| -0.916000000000218 | 0.419 | 0.4 | 0.382 |
| -0.912000000000218 | 0.42 | 0.402 | 0.384 |
| -0.908000000000217 | 0.422 | 0.403 | 0.385 |
| -0.904000000000217 | 0.424 | 0.405 | 0.387 |
| -0.900000000000217 | 0.425 | 0.407 | 0.389 |
| -0.896000000000217 | 0.427 | 0.408 | 0.39 |
| -0.892000000000217 | 0.429 | 0.41 | 0.392 |
| -0.888000000000217 | 0.43 | 0.411 | 0.394 |
| -0.884000000000217 | 0.432 | 0.413 | 0.395 |
| -0.880000000000217 | 0.433 | 0.415 | 0.397 |
| -0.876000000000217 | 0.435 | 0.416 | 0.399 |
| -0.872000000000217 | 0.437 | 0.418 | 0.4 |
| -0.868000000000217 | 0.438 | 0.42 | 0.402 |
| -0.864000000000217 | 0.44 | 0.421 | 0.404 |
| -0.860000000000217 | 0.442 | 0.423 | 0.405 |
| -0.856000000000217 | 0.443 | 0.425 | 0.407 |
| -0.852000000000217 | 0.445 | 0.427 | 0.409 |
| -0.848000000000217 | 0.447 | 0.428 | 0.41 |
| -0.844000000000217 | 0.449 | 0.43 | 0.412 |
| -0.840000000000217 | 0.45 | 0.432 | 0.414 |
| -0.836000000000217 | 0.452 | 0.433 | 0.416 |
| -0.832000000000217 | 0.454 | 0.435 | 0.417 |
| -0.828000000000217 | 0.455 | 0.437 | 0.419 |
| -0.824000000000217 | 0.457 | 0.439 | 0.421 |
| -0.820000000000217 | 0.459 | 0.44 | 0.423 |
| -0.816000000000217 | 0.461 | 0.442 | 0.425 |
| -0.812000000000217 | 0.462 | 0.444 | 0.426 |
| -0.808000000000217 | 0.464 | 0.446 | 0.428 |
| -0.804000000000217 | 0.466 | 0.448 | 0.43 |
| -0.800000000000217 | 0.468 | 0.449 | 0.432 |
| -0.796000000000217 | 0.469 | 0.451 | 0.434 |
| -0.792000000000217 | 0.471 | 0.453 | 0.435 |
| -0.788000000000217 | 0.473 | 0.455 | 0.437 |
| -0.784000000000217 | 0.475 | 0.457 | 0.439 |
| -0.780000000000217 | 0.477 | 0.458 | 0.441 |
| -0.776000000000217 | 0.478 | 0.46 | 0.443 |
| -0.772000000000217 | 0.48 | 0.462 | 0.445 |
| -0.768000000000217 | 0.482 | 0.464 | 0.446 |
| -0.764000000000217 | 0.484 | 0.466 | 0.448 |
| -0.760000000000217 | 0.486 | 0.468 | 0.45 |
| -0.756000000000217 | 0.488 | 0.47 | 0.452 |
| -0.752000000000217 | 0.489 | 0.471 | 0.454 |
| -0.748000000000217 | 0.491 | 0.473 | 0.456 |
| -0.744000000000217 | 0.493 | 0.475 | 0.458 |
| -0.740000000000217 | 0.495 | 0.477 | 0.46 |
| -0.736000000000217 | 0.497 | 0.479 | 0.462 |
| -0.732000000000217 | 0.499 | 0.481 | 0.464 |
| -0.728000000000217 | 0.501 | 0.483 | 0.466 |
| -0.724000000000217 | 0.503 | 0.485 | 0.468 |
| -0.720000000000217 | 0.505 | 0.487 | 0.47 |
| -0.716000000000217 | 0.507 | 0.489 | 0.472 |
| -0.712000000000217 | 0.508 | 0.491 | 0.474 |
| -0.708000000000217 | 0.51 | 0.493 | 0.475 |
| -0.704000000000217 | 0.512 | 0.495 | 0.477 |
| -0.700000000000217 | 0.514 | 0.497 | 0.48 |
| -0.696000000000217 | 0.516 | 0.499 | 0.482 |
| -0.692000000000217 | 0.518 | 0.501 | 0.484 |
| -0.688000000000217 | 0.52 | 0.503 | 0.486 |
| -0.684000000000217 | 0.522 | 0.505 | 0.488 |
| -0.680000000000217 | 0.524 | 0.507 | 0.49 |
| -0.676000000000217 | 0.526 | 0.509 | 0.492 |
| -0.672000000000217 | 0.528 | 0.511 | 0.494 |
| -0.668000000000217 | 0.53 | 0.513 | 0.496 |
| -0.664000000000217 | 0.532 | 0.515 | 0.498 |
| -0.660000000000217 | 0.534 | 0.517 | 0.5 |
| -0.656000000000217 | 0.536 | 0.519 | 0.502 |
| -0.652000000000217 | 0.538 | 0.521 | 0.504 |
| -0.648000000000217 | 0.54 | 0.523 | 0.506 |
| -0.644000000000217 | 0.542 | 0.525 | 0.509 |
| -0.640000000000217 | 0.544 | 0.527 | 0.511 |
| -0.636000000000217 | 0.547 | 0.529 | 0.513 |
| -0.632000000000217 | 0.549 | 0.532 | 0.515 |
| -0.628000000000217 | 0.551 | 0.534 | 0.517 |
| -0.624000000000217 | 0.553 | 0.536 | 0.519 |
| -0.620000000000217 | 0.555 | 0.538 | 0.522 |
| -0.616000000000217 | 0.557 | 0.54 | 0.524 |
| -0.612000000000217 | 0.559 | 0.542 | 0.526 |
| -0.608000000000217 | 0.561 | 0.544 | 0.528 |
| -0.604000000000217 | 0.563 | 0.547 | 0.53 |
| -0.600000000000217 | 0.566 | 0.549 | 0.533 |
| -0.596000000000217 | 0.568 | 0.551 | 0.535 |
| -0.592000000000217 | 0.57 | 0.553 | 0.537 |
| -0.588000000000217 | 0.572 | 0.555 | 0.539 |
| -0.584000000000217 | 0.574 | 0.558 | 0.542 |
| -0.580000000000217 | 0.576 | 0.56 | 0.544 |
| -0.576000000000217 | 0.579 | 0.562 | 0.546 |
| -0.572000000000217 | 0.581 | 0.564 | 0.548 |
| -0.568000000000217 | 0.583 | 0.567 | 0.551 |
| -0.564000000000217 | 0.585 | 0.569 | 0.553 |
| -0.560000000000217 | 0.587 | 0.571 | 0.555 |
| -0.556000000000217 | 0.59 | 0.573 | 0.558 |
| -0.552000000000217 | 0.592 | 0.576 | 0.56 |
| -0.548000000000217 | 0.594 | 0.578 | 0.562 |
| -0.544000000000217 | 0.596 | 0.58 | 0.565 |
| -0.540000000000217 | 0.599 | 0.583 | 0.567 |
| -0.536000000000217 | 0.601 | 0.585 | 0.57 |
| -0.532000000000217 | 0.603 | 0.587 | 0.572 |
| -0.528000000000217 | 0.606 | 0.59 | 0.574 |
| -0.524000000000217 | 0.608 | 0.592 | 0.577 |
| -0.520000000000217 | 0.61 | 0.595 | 0.579 |
| -0.516000000000217 | 0.613 | 0.597 | 0.582 |
| -0.512000000000217 | 0.615 | 0.599 | 0.584 |
| -0.508000000000217 | 0.617 | 0.602 | 0.587 |
| -0.504000000000217 | 0.62 | 0.604 | 0.589 |
| -0.500000000000217 | 0.622 | 0.607 | 0.592 |
| -0.496000000000217 | 0.624 | 0.609 | 0.594 |
| -0.492000000000217 | 0.627 | 0.611 | 0.597 |
| -0.488000000000217 | 0.629 | 0.614 | 0.599 |
| -0.484000000000217 | 0.631 | 0.616 | 0.602 |
| -0.480000000000217 | 0.634 | 0.619 | 0.604 |
| -0.476000000000217 | 0.636 | 0.621 | 0.607 |
| -0.472000000000217 | 0.639 | 0.624 | 0.609 |
| -0.468000000000217 | 0.641 | 0.626 | 0.612 |
| -0.464000000000217 | 0.644 | 0.629 | 0.614 |
| -0.460000000000217 | 0.646 | 0.631 | 0.617 |
| -0.456000000000217 | 0.648 | 0.634 | 0.62 |
| -0.452000000000217 | 0.651 | 0.636 | 0.622 |
| -0.448000000000217 | 0.653 | 0.639 | 0.625 |
| -0.444000000000217 | 0.656 | 0.641 | 0.627 |
| -0.440000000000217 | 0.658 | 0.644 | 0.63 |
| -0.436000000000217 | 0.661 | 0.647 | 0.633 |
| -0.432000000000217 | 0.663 | 0.649 | 0.635 |
| -0.428000000000217 | 0.666 | 0.652 | 0.638 |
| -0.424000000000217 | 0.668 | 0.654 | 0.641 |
| -0.420000000000217 | 0.671 | 0.657 | 0.643 |
| -0.416000000000217 | 0.674 | 0.66 | 0.646 |
| -0.412000000000217 | 0.676 | 0.662 | 0.649 |
| -0.408000000000217 | 0.679 | 0.665 | 0.652 |
| -0.404000000000217 | 0.681 | 0.668 | 0.654 |
| -0.400000000000217 | 0.684 | 0.67 | 0.657 |
| -0.396000000000217 | 0.686 | 0.673 | 0.66 |
| -0.392000000000217 | 0.689 | 0.676 | 0.663 |
| -0.388000000000217 | 0.692 | 0.678 | 0.665 |
| -0.384000000000217 | 0.694 | 0.681 | 0.668 |
| -0.380000000000217 | 0.697 | 0.684 | 0.671 |
| -0.376000000000217 | 0.7 | 0.687 | 0.674 |
| -0.372000000000217 | 0.702 | 0.689 | 0.677 |
| -0.368000000000217 | 0.705 | 0.692 | 0.679 |
| -0.364000000000217 | 0.708 | 0.695 | 0.682 |
| -0.360000000000217 | 0.71 | 0.698 | 0.685 |
| -0.356000000000217 | 0.713 | 0.7 | 0.688 |
| -0.352000000000217 | 0.716 | 0.703 | 0.691 |
| -0.348000000000217 | 0.718 | 0.706 | 0.694 |
| -0.344000000000217 | 0.721 | 0.709 | 0.697 |
| -0.340000000000217 | 0.724 | 0.712 | 0.7 |
| -0.336000000000217 | 0.727 | 0.715 | 0.703 |
| -0.332000000000217 | 0.729 | 0.717 | 0.706 |
| -0.328000000000217 | 0.732 | 0.72 | 0.709 |
| -0.324000000000217 | 0.735 | 0.723 | 0.712 |
| -0.320000000000217 | 0.738 | 0.726 | 0.715 |
| -0.316000000000217 | 0.741 | 0.729 | 0.718 |
| -0.312000000000217 | 0.743 | 0.732 | 0.721 |
| -0.308000000000217 | 0.746 | 0.735 | 0.724 |
| -0.304000000000217 | 0.749 | 0.738 | 0.727 |
| -0.300000000000217 | 0.752 | 0.741 | 0.73 |
| -0.296000000000217 | 0.755 | 0.744 | 0.733 |
| -0.292000000000217 | 0.758 | 0.747 | 0.736 |
| -0.288000000000217 | 0.761 | 0.75 | 0.739 |
| -0.284000000000217 | 0.764 | 0.753 | 0.742 |
| -0.280000000000217 | 0.766 | 0.756 | 0.745 |
| -0.276000000000217 | 0.769 | 0.759 | 0.748 |
| -0.272000000000217 | 0.772 | 0.762 | 0.752 |
| -0.268000000000217 | 0.775 | 0.765 | 0.755 |
| -0.264000000000217 | 0.778 | 0.768 | 0.758 |
| -0.260000000000217 | 0.781 | 0.771 | 0.761 |
| -0.256000000000217 | 0.784 | 0.774 | 0.764 |
| -0.252000000000217 | 0.787 | 0.777 | 0.768 |
| -0.248000000000217 | 0.79 | 0.78 | 0.771 |
| -0.244000000000217 | 0.793 | 0.783 | 0.774 |
| -0.240000000000217 | 0.796 | 0.787 | 0.777 |
| -0.236000000000217 | 0.799 | 0.79 | 0.781 |
| -0.232000000000217 | 0.802 | 0.793 | 0.784 |
| -0.228000000000217 | 0.805 | 0.796 | 0.787 |
| -0.224000000000217 | 0.808 | 0.799 | 0.79 |
| -0.220000000000217 | 0.811 | 0.803 | 0.794 |
| -0.216000000000217 | 0.814 | 0.806 | 0.797 |
| -0.212000000000217 | 0.818 | 0.809 | 0.8 |
| -0.208000000000217 | 0.821 | 0.812 | 0.804 |
| -0.204000000000217 | 0.824 | 0.815 | 0.807 |
| -0.200000000000217 | 0.827 | 0.819 | 0.811 |
| -0.196000000000217 | 0.83 | 0.822 | 0.814 |
| -0.192000000000217 | 0.833 | 0.825 | 0.817 |
| -0.188000000000217 | 0.836 | 0.829 | 0.821 |
| -0.184000000000217 | 0.84 | 0.832 | 0.824 |
| -0.180000000000217 | 0.843 | 0.835 | 0.828 |
| -0.176000000000217 | 0.846 | 0.839 | 0.831 |
| -0.172000000000217 | 0.849 | 0.842 | 0.835 |
| -0.168000000000217 | 0.852 | 0.845 | 0.838 |
| -0.164000000000217 | 0.856 | 0.849 | 0.842 |
| -0.160000000000217 | 0.859 | 0.852 | 0.845 |
| -0.156000000000217 | 0.862 | 0.856 | 0.849 |
| -0.152000000000217 | 0.866 | 0.859 | 0.852 |
| -0.148000000000217 | 0.869 | 0.862 | 0.856 |
| -0.144000000000217 | 0.872 | 0.866 | 0.86 |
| -0.140000000000217 | 0.875 | 0.869 | 0.863 |
| -0.136000000000217 | 0.879 | 0.873 | 0.867 |
| -0.132000000000217 | 0.882 | 0.876 | 0.871 |
| -0.128000000000217 | 0.886 | 0.88 | 0.874 |
| -0.124000000000217 | 0.889 | 0.883 | 0.878 |
| -0.120000000000217 | 0.892 | 0.887 | 0.882 |
| -0.116000000000217 | 0.896 | 0.89 | 0.885 |
| -0.112000000000217 | 0.899 | 0.894 | 0.889 |
| -0.108000000000217 | 0.902 | 0.898 | 0.893 |
| -0.104000000000217 | 0.906 | 0.901 | 0.897 |
| -0.100000000000217 | 0.909 | 0.905 | 0.9 |
| -0.0960000000002168 | 0.913 | 0.908 | 0.904 |
| -0.0920000000002168 | 0.916 | 0.912 | 0.908 |
| -0.0880000000002168 | 0.92 | 0.916 | 0.912 |
| -0.0840000000002168 | 0.923 | 0.919 | 0.916 |
| -0.0800000000002168 | 0.927 | 0.923 | 0.919 |
| -0.0760000000002168 | 0.93 | 0.927 | 0.923 |
| -0.0720000000002168 | 0.934 | 0.931 | 0.927 |
| -0.0680000000002168 | 0.937 | 0.934 | 0.931 |
| -0.0640000000002168 | 0.941 | 0.938 | 0.935 |
| -0.0600000000002168 | 0.945 | 0.942 | 0.939 |
| -0.0560000000002168 | 0.948 | 0.946 | 0.943 |
| -0.0520000000002168 | 0.952 | 0.949 | 0.947 |
| -0.0480000000002167 | 0.955 | 0.953 | 0.951 |
| -0.0440000000002167 | 0.959 | 0.957 | 0.955 |
| -0.0400000000002167 | 0.963 | 0.961 | 0.959 |
| -0.0360000000002167 | 0.966 | 0.965 | 0.963 |
| -0.0320000000002167 | 0.97 | 0.969 | 0.967 |
| -0.0280000000002167 | 0.974 | 0.972 | 0.971 |
| -0.0240000000002167 | 0.977 | 0.976 | 0.975 |
| -0.0200000000002167 | 0.981 | 0.98 | 0.979 |
| -0.0160000000002167 | 0.985 | 0.984 | 0.983 |
| -0.0120000000002167 | 0.989 | 0.988 | 0.987 |
| -0.00800000000021674 | 0.992 | 0.992 | 0.992 |
| -0.00400000000021674 | 0.996 | 0.996 | 0.996 |
| -2.16743289982446e-13 | 1 | 1 | 1 |
| 0.00399999999978326 | 1.004 | 1.004 | 1.004 |
| 0.00799999999978325 | 1.008 | 1.008 | 1.008 |
| 0.0119999999997833 | 1.011 | 1.012 | 1.013 |
| 0.0159999999997833 | 1.015 | 1.016 | 1.017 |
| 0.0199999999997833 | 1.019 | 1.02 | 1.021 |
| 0.0239999999997833 | 1.023 | 1.024 | 1.026 |
| 0.0279999999997833 | 1.027 | 1.028 | 1.03 |
| 0.0319999999997833 | 1.031 | 1.033 | 1.034 |
| 0.0359999999997833 | 1.035 | 1.037 | 1.039 |
| 0.0399999999997833 | 1.039 | 1.041 | 1.043 |
| 0.0439999999997833 | 1.043 | 1.045 | 1.047 |
| 0.0479999999997833 | 1.047 | 1.049 | 1.052 |
| 0.0519999999997833 | 1.051 | 1.053 | 1.056 |
| 0.0559999999997833 | 1.055 | 1.058 | 1.061 |
| 0.0599999999997833 | 1.059 | 1.062 | 1.065 |
| 0.0639999999997833 | 1.063 | 1.066 | 1.07 |
| 0.0679999999997833 | 1.067 | 1.07 | 1.074 |
| 0.0719999999997833 | 1.071 | 1.075 | 1.079 |
| 0.0759999999997833 | 1.075 | 1.079 | 1.083 |
| 0.0799999999997833 | 1.079 | 1.083 | 1.088 |
| 0.0839999999997833 | 1.083 | 1.088 | 1.092 |
| 0.0879999999997833 | 1.087 | 1.092 | 1.097 |
| 0.0919999999997833 | 1.091 | 1.096 | 1.101 |
| 0.0959999999997833 | 1.095 | 1.101 | 1.106 |
| 0.0999999999997833 | 1.1 | 1.105 | 1.111 |
| 0.103999999999783 | 1.104 | 1.11 | 1.115 |
| 0.107999999999783 | 1.108 | 1.114 | 1.12 |
| 0.111999999999783 | 1.112 | 1.119 | 1.125 |
| 0.115999999999783 | 1.117 | 1.123 | 1.13 |
| 0.119999999999783 | 1.121 | 1.127 | 1.134 |
| 0.123999999999783 | 1.125 | 1.132 | 1.139 |
| 0.127999999999783 | 1.129 | 1.137 | 1.144 |
| 0.131999999999783 | 1.134 | 1.141 | 1.149 |
| 0.135999999999783 | 1.138 | 1.146 | 1.153 |
| 0.139999999999783 | 1.142 | 1.15 | 1.158 |
| 0.143999999999783 | 1.147 | 1.155 | 1.163 |
| 0.147999999999783 | 1.151 | 1.16 | 1.168 |
| 0.151999999999783 | 1.155 | 1.164 | 1.173 |
| 0.155999999999783 | 1.16 | 1.169 | 1.178 |
| 0.159999999999783 | 1.164 | 1.174 | 1.183 |
| 0.163999999999783 | 1.169 | 1.178 | 1.188 |
| 0.167999999999783 | 1.173 | 1.183 | 1.193 |
| 0.171999999999783 | 1.178 | 1.188 | 1.198 |
| 0.175999999999783 | 1.182 | 1.192 | 1.203 |
| 0.179999999999783 | 1.186 | 1.197 | 1.208 |
| 0.183999999999783 | 1.191 | 1.202 | 1.213 |
| 0.187999999999783 | 1.196 | 1.207 | 1.218 |
| 0.191999999999783 | 1.2 | 1.212 | 1.223 |
| 0.195999999999783 | 1.205 | 1.217 | 1.229 |
| 0.199999999999783 | 1.209 | 1.221 | 1.234 |
| 0.203999999999783 | 1.214 | 1.226 | 1.239 |
| 0.207999999999783 | 1.218 | 1.231 | 1.244 |
| 0.211999999999783 | 1.223 | 1.236 | 1.249 |
| 0.215999999999783 | 1.228 | 1.241 | 1.255 |
| 0.219999999999783 | 1.232 | 1.246 | 1.26 |
| 0.223999999999783 | 1.237 | 1.251 | 1.265 |
| 0.227999999999783 | 1.242 | 1.256 | 1.27 |
| 0.231999999999783 | 1.247 | 1.261 | 1.276 |
| 0.235999999999783 | 1.251 | 1.266 | 1.281 |
| 0.239999999999783 | 1.256 | 1.271 | 1.287 |
| 0.243999999999783 | 1.261 | 1.276 | 1.292 |
| 0.247999999999783 | 1.266 | 1.281 | 1.297 |
| 0.251999999999783 | 1.27 | 1.287 | 1.303 |
| 0.255999999999783 | 1.275 | 1.292 | 1.308 |
| 0.259999999999783 | 1.28 | 1.297 | 1.314 |
| 0.263999999999783 | 1.285 | 1.302 | 1.319 |
| 0.267999999999783 | 1.29 | 1.307 | 1.325 |
| 0.271999999999783 | 1.295 | 1.313 | 1.331 |
| 0.275999999999783 | 1.3 | 1.318 | 1.336 |
| 0.279999999999783 | 1.305 | 1.323 | 1.342 |
| 0.283999999999783 | 1.31 | 1.328 | 1.347 |
| 0.287999999999783 | 1.315 | 1.334 | 1.353 |
| 0.291999999999783 | 1.32 | 1.339 | 1.359 |
| 0.295999999999783 | 1.325 | 1.344 | 1.365 |
| 0.299999999999783 | 1.33 | 1.35 | 1.37 |
| 0.303999999999783 | 1.335 | 1.355 | 1.376 |
| 0.307999999999783 | 1.34 | 1.361 | 1.382 |
| 0.311999999999783 | 1.345 | 1.366 | 1.388 |
| 0.315999999999783 | 1.35 | 1.372 | 1.393 |
| 0.319999999999783 | 1.355 | 1.377 | 1.399 |
| 0.323999999999783 | 1.36 | 1.383 | 1.405 |
| 0.327999999999783 | 1.366 | 1.388 | 1.411 |
| 0.331999999999783 | 1.371 | 1.394 | 1.417 |
| 0.335999999999783 | 1.376 | 1.399 | 1.423 |
| 0.339999999999783 | 1.381 | 1.405 | 1.429 |
| 0.343999999999783 | 1.387 | 1.411 | 1.435 |
| 0.347999999999783 | 1.392 | 1.416 | 1.441 |
| 0.351999999999783 | 1.397 | 1.422 | 1.447 |
| 0.355999999999783 | 1.402 | 1.428 | 1.453 |
| 0.359999999999783 | 1.408 | 1.433 | 1.459 |
| 0.363999999999783 | 1.413 | 1.439 | 1.466 |
| 0.367999999999783 | 1.419 | 1.445 | 1.472 |
| 0.371999999999784 | 1.424 | 1.451 | 1.478 |
| 0.375999999999784 | 1.429 | 1.456 | 1.484 |
| 0.379999999999784 | 1.435 | 1.462 | 1.49 |
| 0.383999999999784 | 1.44 | 1.468 | 1.497 |
| 0.387999999999784 | 1.446 | 1.474 | 1.503 |
| 0.391999999999784 | 1.451 | 1.48 | 1.509 |
| 0.395999999999784 | 1.457 | 1.486 | 1.516 |
| 0.399999999999784 | 1.462 | 1.492 | 1.522 |
| 0.403999999999784 | 1.468 | 1.498 | 1.528 |
| 0.407999999999784 | 1.473 | 1.504 | 1.535 |
| 0.411999999999784 | 1.479 | 1.51 | 1.541 |
| 0.415999999999784 | 1.485 | 1.516 | 1.548 |
| 0.419999999999784 | 1.49 | 1.522 | 1.554 |
| 0.423999999999784 | 1.496 | 1.528 | 1.561 |
| 0.427999999999784 | 1.502 | 1.534 | 1.567 |
| 0.431999999999784 | 1.507 | 1.54 | 1.574 |
| 0.435999999999784 | 1.513 | 1.547 | 1.581 |
| 0.439999999999784 | 1.519 | 1.553 | 1.587 |
| 0.443999999999784 | 1.525 | 1.559 | 1.594 |
| 0.447999999999784 | 1.531 | 1.565 | 1.601 |
| 0.451999999999784 | 1.536 | 1.571 | 1.607 |
| 0.455999999999784 | 1.542 | 1.578 | 1.614 |
| 0.459999999999784 | 1.548 | 1.584 | 1.621 |
| 0.463999999999784 | 1.554 | 1.59 | 1.628 |
| 0.467999999999784 | 1.56 | 1.597 | 1.635 |
| 0.471999999999784 | 1.566 | 1.603 | 1.641 |
| 0.475999999999784 | 1.572 | 1.61 | 1.648 |
| 0.479999999999784 | 1.578 | 1.616 | 1.655 |
| 0.483999999999784 | 1.584 | 1.623 | 1.662 |
| 0.487999999999784 | 1.59 | 1.629 | 1.669 |
| 0.491999999999784 | 1.596 | 1.636 | 1.676 |
| 0.495999999999784 | 1.602 | 1.642 | 1.683 |
| 0.499999999999784 | 1.608 | 1.649 | 1.69 |
| 0.503999999999784 | 1.614 | 1.655 | 1.698 |
| 0.507999999999784 | 1.62 | 1.662 | 1.705 |
| 0.511999999999784 | 1.626 | 1.669 | 1.712 |
| 0.515999999999784 | 1.633 | 1.675 | 1.719 |
| 0.519999999999784 | 1.639 | 1.682 | 1.726 |
| 0.523999999999784 | 1.645 | 1.689 | 1.734 |
| 0.527999999999784 | 1.651 | 1.696 | 1.741 |
| 0.531999999999784 | 1.658 | 1.702 | 1.748 |
| 0.535999999999784 | 1.664 | 1.709 | 1.756 |
| 0.539999999999784 | 1.67 | 1.716 | 1.763 |
| 0.543999999999784 | 1.677 | 1.723 | 1.77 |
| 0.547999999999784 | 1.683 | 1.73 | 1.778 |
| 0.551999999999784 | 1.689 | 1.737 | 1.785 |
| 0.555999999999784 | 1.696 | 1.744 | 1.793 |
| 0.559999999999784 | 1.702 | 1.751 | 1.8 |
| 0.563999999999784 | 1.709 | 1.758 | 1.808 |
| 0.567999999999784 | 1.715 | 1.765 | 1.816 |
| 0.571999999999784 | 1.722 | 1.772 | 1.823 |
| 0.575999999999784 | 1.728 | 1.779 | 1.831 |
| 0.579999999999784 | 1.735 | 1.786 | 1.839 |
| 0.583999999999784 | 1.742 | 1.793 | 1.846 |
| 0.587999999999784 | 1.748 | 1.8 | 1.854 |
| 0.591999999999784 | 1.755 | 1.808 | 1.862 |
| 0.595999999999784 | 1.762 | 1.815 | 1.87 |
| 0.599999999999784 | 1.768 | 1.822 | 1.878 |
| 0.603999999999784 | 1.775 | 1.829 | 1.886 |
| 0.607999999999784 | 1.782 | 1.837 | 1.893 |
| 0.611999999999784 | 1.789 | 1.844 | 1.901 |
| 0.615999999999784 | 1.795 | 1.852 | 1.909 |
| 0.619999999999784 | 1.802 | 1.859 | 1.917 |
| 0.623999999999784 | 1.809 | 1.866 | 1.926 |
| 0.627999999999784 | 1.816 | 1.874 | 1.934 |
| 0.631999999999784 | 1.823 | 1.881 | 1.942 |
| 0.635999999999784 | 1.83 | 1.889 | 1.95 |
| 0.639999999999784 | 1.837 | 1.896 | 1.958 |
| 0.643999999999784 | 1.844 | 1.904 | 1.966 |
| 0.647999999999784 | 1.851 | 1.912 | 1.975 |
| 0.651999999999784 | 1.858 | 1.919 | 1.983 |
| 0.655999999999784 | 1.865 | 1.927 | 1.991 |
| 0.659999999999784 | 1.872 | 1.935 | 2 |
| 0.663999999999784 | 1.879 | 1.943 | 2.008 |
| 0.667999999999784 | 1.886 | 1.95 | 2.017 |
| 0.671999999999784 | 1.893 | 1.958 | 2.025 |
| 0.675999999999784 | 1.901 | 1.966 | 2.034 |
| 0.679999999999784 | 1.908 | 1.974 | 2.042 |
| 0.683999999999784 | 1.915 | 1.982 | 2.051 |
| 0.687999999999784 | 1.922 | 1.99 | 2.059 |
| 0.691999999999784 | 1.93 | 1.998 | 2.068 |
| 0.695999999999784 | 1.937 | 2.006 | 2.077 |
| 0.699999999999784 | 1.944 | 2.014 | 2.085 |
| 0.703999999999784 | 1.952 | 2.022 | 2.094 |
| 0.707999999999784 | 1.959 | 2.03 | 2.103 |
| 0.711999999999784 | 1.967 | 2.038 | 2.112 |
| 0.715999999999784 | 1.974 | 2.046 | 2.121 |
| 0.719999999999784 | 1.982 | 2.054 | 2.13 |
| 0.723999999999784 | 1.989 | 2.063 | 2.139 |
| 0.727999999999784 | 1.997 | 2.071 | 2.148 |
| 0.731999999999784 | 2.005 | 2.079 | 2.157 |
| 0.735999999999784 | 2.012 | 2.088 | 2.166 |
| 0.739999999999784 | 2.02 | 2.096 | 2.175 |
| 0.743999999999784 | 2.027 | 2.104 | 2.184 |
| 0.747999999999784 | 2.035 | 2.113 | 2.193 |
| 0.751999999999784 | 2.043 | 2.121 | 2.203 |
| 0.755999999999784 | 2.051 | 2.13 | 2.212 |
| 0.759999999999784 | 2.059 | 2.138 | 2.221 |
| 0.763999999999784 | 2.066 | 2.147 | 2.23 |
| 0.767999999999784 | 2.074 | 2.155 | 2.24 |
| 0.771999999999784 | 2.082 | 2.164 | 2.249 |
| 0.775999999999784 | 2.09 | 2.173 | 2.259 |
| 0.779999999999784 | 2.098 | 2.181 | 2.268 |
| 0.783999999999784 | 2.106 | 2.19 | 2.278 |
| 0.787999999999784 | 2.114 | 2.199 | 2.287 |
| 0.791999999999784 | 2.122 | 2.208 | 2.297 |
| 0.795999999999784 | 2.13 | 2.217 | 2.307 |
| 0.799999999999784 | 2.138 | 2.226 | 2.316 |
| 0.803999999999784 | 2.146 | 2.234 | 2.326 |
| 0.807999999999784 | 2.155 | 2.243 | 2.336 |
| 0.811999999999784 | 2.163 | 2.252 | 2.346 |
| 0.815999999999784 | 2.171 | 2.261 | 2.356 |
| 0.819999999999784 | 2.179 | 2.27 | 2.366 |
| 0.823999999999784 | 2.188 | 2.28 | 2.375 |
| 0.827999999999784 | 2.196 | 2.289 | 2.385 |
| 0.831999999999784 | 2.204 | 2.298 | 2.396 |
| 0.835999999999784 | 2.213 | 2.307 | 2.406 |
| 0.839999999999784 | 2.221 | 2.316 | 2.416 |
| 0.843999999999784 | 2.23 | 2.326 | 2.426 |
| 0.847999999999784 | 2.238 | 2.335 | 2.436 |
| 0.851999999999784 | 2.247 | 2.344 | 2.446 |
| 0.855999999999784 | 2.255 | 2.354 | 2.457 |
| 0.859999999999784 | 2.264 | 2.363 | 2.467 |
| 0.863999999999784 | 2.272 | 2.373 | 2.477 |
| 0.867999999999784 | 2.281 | 2.382 | 2.488 |
| 0.871999999999784 | 2.29 | 2.392 | 2.498 |
| 0.875999999999784 | 2.298 | 2.401 | 2.509 |
| 0.879999999999784 | 2.307 | 2.411 | 2.519 |
| 0.883999999999784 | 2.316 | 2.421 | 2.53 |
| 0.887999999999784 | 2.325 | 2.43 | 2.541 |
| 0.891999999999784 | 2.334 | 2.44 | 2.551 |
| 0.895999999999784 | 2.342 | 2.45 | 2.562 |
| 0.899999999999784 | 2.351 | 2.46 | 2.573 |
| 0.903999999999784 | 2.36 | 2.469 | 2.584 |
| 0.907999999999784 | 2.369 | 2.479 | 2.595 |
| 0.911999999999784 | 2.378 | 2.489 | 2.605 |
| 0.915999999999784 | 2.387 | 2.499 | 2.616 |
| 0.919999999999784 | 2.396 | 2.509 | 2.627 |
| 0.923999999999784 | 2.406 | 2.519 | 2.638 |
| 0.927999999999784 | 2.415 | 2.529 | 2.65 |
| 0.931999999999784 | 2.424 | 2.54 | 2.661 |
| 0.935999999999784 | 2.433 | 2.55 | 2.672 |
| 0.939999999999784 | 2.442 | 2.56 | 2.683 |
| 0.943999999999784 | 2.452 | 2.57 | 2.694 |
| 0.947999999999784 | 2.461 | 2.581 | 2.706 |
| 0.951999999999784 | 2.47 | 2.591 | 2.717 |
| 0.955999999999784 | 2.48 | 2.601 | 2.729 |
| 0.959999999999784 | 2.489 | 2.612 | 2.74 |
| 0.963999999999784 | 2.499 | 2.622 | 2.752 |
| 0.967999999999784 | 2.508 | 2.633 | 2.763 |
| 0.971999999999784 | 2.518 | 2.643 | 2.775 |
| 0.975999999999784 | 2.527 | 2.654 | 2.787 |
| 0.979999999999784 | 2.537 | 2.664 | 2.798 |
| 0.983999999999784 | 2.547 | 2.675 | 2.81 |
| 0.987999999999784 | 2.556 | 2.686 | 2.822 |
| 0.991999999999784 | 2.566 | 2.697 | 2.834 |
| 0.995999999999784 | 2.576 | 2.707 | 2.846 |
| 0.999999999999784 | 2.586 | 2.718 | 2.858 |
| 1.003999999999784 | 2.596 | 2.729 | 2.87 |
| 1.007999999999784 | 2.605 | 2.74 | 2.882 |
| 1.011999999999784 | 2.615 | 2.751 | 2.894 |
| 1.015999999999784 | 2.625 | 2.762 | 2.906 |
| 1.019999999999784 | 2.635 | 2.773 | 2.918 |
| 1.023999999999784 | 2.645 | 2.784 | 2.931 |
| 1.027999999999784 | 2.655 | 2.795 | 2.943 |
| 1.031999999999784 | 2.666 | 2.807 | 2.955 |
| 1.035999999999784 | 2.676 | 2.818 | 2.968 |
| 1.039999999999784 | 2.686 | 2.829 | 2.98 |
| 1.043999999999784 | 2.696 | 2.841 | 2.993 |
| 1.047999999999784 | 2.706 | 2.852 | 3.005 |
| 1.051999999999784 | 2.717 | 2.863 | 3.018 |
| 1.055999999999784 | 2.727 | 2.875 | 3.031 |
| 1.059999999999784 | 2.737 | 2.886 | 3.043 |
| 1.063999999999784 | 2.748 | 2.898 | 3.056 |
| 1.067999999999784 | 2.758 | 2.91 | 3.069 |
| 1.071999999999784 | 2.769 | 2.921 | 3.082 |
| 1.075999999999784 | 2.779 | 2.933 | 3.095 |
| 1.079999999999784 | 2.79 | 2.945 | 3.108 |
| 1.083999999999784 | 2.801 | 2.956 | 3.121 |
| 1.087999999999784 | 2.811 | 2.968 | 3.134 |
| 1.091999999999784 | 2.822 | 2.98 | 3.147 |
| 1.095999999999784 | 2.833 | 2.992 | 3.161 |
| 1.099999999999784 | 2.843 | 3.004 | 3.174 |
| 1.103999999999784 | 2.854 | 3.016 | 3.187 |
| 1.107999999999784 | 2.865 | 3.028 | 3.201 |
| 1.111999999999784 | 2.876 | 3.04 | 3.214 |
| 1.115999999999784 | 2.887 | 3.053 | 3.228 |
| 1.119999999999784 | 2.898 | 3.065 | 3.241 |
| 1.123999999999784 | 2.909 | 3.077 | 3.255 |
| 1.127999999999784 | 2.92 | 3.089 | 3.269 |
| 1.131999999999784 | 2.931 | 3.102 | 3.282 |
| 1.135999999999784 | 2.942 | 3.114 | 3.296 |
| 1.139999999999784 | 2.954 | 3.127 | 3.31 |
| 1.143999999999784 | 2.965 | 3.139 | 3.324 |
| 1.147999999999784 | 2.976 | 3.152 | 3.338 |
| 1.151999999999784 | 2.987 | 3.165 | 3.352 |
| 1.155999999999784 | 2.999 | 3.177 | 3.366 |
| 1.159999999999784 | 3.01 | 3.19 | 3.38 |
| 1.163999999999784 | 3.022 | 3.203 | 3.395 |
| 1.167999999999784 | 3.033 | 3.216 | 3.409 |
| 1.171999999999784 | 3.045 | 3.228 | 3.423 |
| 1.175999999999784 | 3.056 | 3.241 | 3.438 |
| 1.179999999999784 | 3.068 | 3.254 | 3.452 |
| 1.183999999999784 | 3.08 | 3.267 | 3.467 |
| 1.187999999999784 | 3.091 | 3.281 | 3.481 |
| 1.191999999999784 | 3.103 | 3.294 | 3.496 |
| 1.195999999999784 | 3.115 | 3.307 | 3.511 |
| 1.199999999999784 | 3.127 | 3.32 | 3.525 |
| 1.203999999999784 | 3.139 | 3.333 | 3.54 |
| 1.207999999999784 | 3.151 | 3.347 | 3.555 |
| 1.211999999999784 | 3.163 | 3.36 | 3.57 |
| 1.215999999999784 | 3.175 | 3.374 | 3.585 |
| 1.219999999999784 | 3.187 | 3.387 | 3.6 |
| 1.223999999999784 | 3.199 | 3.401 | 3.615 |
| 1.227999999999784 | 3.211 | 3.414 | 3.631 |
| 1.231999999999784 | 3.223 | 3.428 | 3.646 |
| 1.235999999999784 | 3.236 | 3.442 | 3.661 |
| 1.239999999999784 | 3.248 | 3.456 | 3.677 |
| 1.243999999999784 | 3.26 | 3.469 | 3.692 |
| 1.247999999999784 | 3.273 | 3.483 | 3.708 |
| 1.251999999999784 | 3.285 | 3.497 | 3.723 |
| 1.255999999999784 | 3.298 | 3.511 | 3.739 |
| 1.259999999999784 | 3.31 | 3.525 | 3.755 |
| 1.263999999999784 | 3.323 | 3.54 | 3.77 |
| 1.267999999999784 | 3.335 | 3.554 | 3.786 |
| 1.271999999999784 | 3.348 | 3.568 | 3.802 |
| 1.275999999999784 | 3.361 | 3.582 | 3.818 |
| 1.279999999999784 | 3.374 | 3.597 | 3.834 |
| 1.283999999999784 | 3.387 | 3.611 | 3.85 |
| 1.287999999999784 | 3.399 | 3.626 | 3.867 |
| 1.291999999999784 | 3.412 | 3.64 | 3.883 |
| 1.295999999999784 | 3.425 | 3.655 | 3.899 |
| 1.299999999999784 | 3.438 | 3.669 | 3.916 |
| 1.303999999999784 | 3.451 | 3.684 | 3.932 |
| 1.307999999999784 | 3.465 | 3.699 | 3.949 |
| 1.311999999999784 | 3.478 | 3.714 | 3.965 |
| 1.315999999999784 | 3.491 | 3.728 | 3.982 |
| 1.319999999999784 | 3.504 | 3.743 | 3.999 |
| 1.323999999999784 | 3.518 | 3.758 | 4.016 |
| 1.327999999999784 | 3.531 | 3.773 | 4.033 |
| 1.331999999999784 | 3.545 | 3.789 | 4.05 |
| 1.335999999999784 | 3.558 | 3.804 | 4.067 |
| 1.339999999999784 | 3.572 | 3.819 | 4.084 |
| 1.343999999999784 | 3.585 | 3.834 | 4.101 |
| 1.347999999999784 | 3.599 | 3.85 | 4.118 |
| 1.351999999999784 | 3.612 | 3.865 | 4.135 |
| 1.355999999999784 | 3.626 | 3.881 | 4.153 |
| 1.359999999999784 | 3.64 | 3.896 | 4.17 |
| 1.363999999999784 | 3.654 | 3.912 | 4.188 |
| 1.367999999999784 | 3.668 | 3.927 | 4.206 |
| 1.371999999999784 | 3.682 | 3.943 | 4.223 |
| 1.375999999999784 | 3.696 | 3.959 | 4.241 |
| 1.379999999999784 | 3.71 | 3.975 | 4.259 |
| 1.383999999999784 | 3.724 | 3.991 | 4.277 |
| 1.387999999999784 | 3.738 | 4.007 | 4.295 |
| 1.391999999999784 | 3.752 | 4.023 | 4.313 |
| 1.395999999999784 | 3.767 | 4.039 | 4.331 |
| 1.399999999999784 | 3.781 | 4.055 | 4.349 |
| 1.403999999999784 | 3.795 | 4.071 | 4.368 |
| 1.407999999999784 | 3.81 | 4.088 | 4.386 |
| 1.411999999999784 | 3.824 | 4.104 | 4.404 |
| 1.415999999999784 | 3.839 | 4.121 | 4.423 |
| 1.419999999999784 | 3.854 | 4.137 | 4.442 |
| 1.423999999999784 | 3.868 | 4.154 | 4.46 |
| 1.427999999999784 | 3.883 | 4.17 | 4.479 |
| 1.431999999999784 | 3.898 | 4.187 | 4.498 |
| 1.435999999999784 | 3.913 | 4.204 | 4.517 |
| 1.439999999999784 | 3.927 | 4.221 | 4.536 |
| 1.443999999999784 | 3.942 | 4.238 | 4.555 |
| 1.447999999999784 | 3.957 | 4.255 | 4.574 |
| 1.451999999999784 | 3.973 | 4.272 | 4.593 |
| 1.455999999999784 | 3.988 | 4.289 | 4.613 |
| 1.459999999999784 | 4.003 | 4.306 | 4.632 |
| 1.463999999999784 | 4.018 | 4.323 | 4.652 |
| 1.467999999999784 | 4.033 | 4.341 | 4.671 |
| 1.471999999999784 | 4.049 | 4.358 | 4.691 |
| 1.475999999999784 | 4.064 | 4.375 | 4.711 |
| 1.479999999999784 | 4.08 | 4.393 | 4.73 |
| 1.483999999999784 | 4.095 | 4.411 | 4.75 |
| 1.487999999999784 | 4.111 | 4.428 | 4.77 |
| 1.491999999999784 | 4.126 | 4.446 | 4.79 |
| 1.495999999999784 | 4.142 | 4.464 | 4.81 |
| 1.499999999999784 | 4.158 | 4.482 | 4.831 |
| 1.503999999999784 | 4.174 | 4.5 | 4.851 |
| 1.507999999999784 | 4.19 | 4.518 | 4.871 |
| 1.511999999999784 | 4.206 | 4.536 | 4.892 |
| 1.515999999999784 | 4.222 | 4.554 | 4.913 |
| 1.519999999999784 | 4.238 | 4.572 | 4.933 |
| 1.523999999999784 | 4.254 | 4.591 | 4.954 |
| 1.527999999999784 | 4.27 | 4.609 | 4.975 |
| 1.531999999999784 | 4.286 | 4.627 | 4.996 |
| 1.535999999999784 | 4.303 | 4.646 | 5.017 |
| 1.539999999999784 | 4.319 | 4.665 | 5.038 |
| 1.543999999999784 | 4.335 | 4.683 | 5.059 |
| 1.547999999999784 | 4.352 | 4.702 | 5.08 |
| 1.551999999999784 | 4.368 | 4.721 | 5.102 |
| 1.555999999999784 | 4.385 | 4.74 | 5.123 |
| 1.559999999999784 | 4.402 | 4.759 | 5.145 |
| 1.563999999999784 | 4.418 | 4.778 | 5.167 |
| 1.567999999999784 | 4.435 | 4.797 | 5.188 |
| 1.571999999999784 | 4.452 | 4.816 | 5.21 |
| 1.575999999999784 | 4.469 | 4.836 | 5.232 |
| 1.579999999999784 | 4.486 | 4.855 | 5.254 |
| 1.583999999999784 | 4.503 | 4.874 | 5.276 |
| 1.587999999999784 | 4.52 | 4.894 | 5.298 |
| 1.591999999999784 | 4.538 | 4.914 | 5.321 |
| 1.595999999999784 | 4.555 | 4.933 | 5.343 |
| 1.599999999999784 | 4.572 | 4.953 | 5.366 |
| 1.603999999999784 | 4.59 | 4.973 | 5.388 |
| 1.607999999999784 | 4.607 | 4.993 | 5.411 |
| 1.611999999999784 | 4.625 | 5.013 | 5.434 |
| 1.615999999999784 | 4.642 | 5.033 | 5.456 |
| 1.619999999999784 | 4.66 | 5.053 | 5.479 |
| 1.623999999999784 | 4.678 | 5.073 | 5.502 |
| 1.627999999999784 | 4.695 | 5.094 | 5.526 |
| 1.631999999999784 | 4.713 | 5.114 | 5.549 |
| 1.635999999999784 | 4.731 | 5.135 | 5.572 |
| 1.639999999999784 | 4.749 | 5.155 | 5.596 |
| 1.643999999999784 | 4.767 | 5.176 | 5.619 |
| 1.647999999999784 | 4.786 | 5.197 | 5.643 |
| 1.651999999999784 | 4.804 | 5.217 | 5.667 |
| 1.655999999999784 | 4.822 | 5.238 | 5.691 |
| 1.659999999999784 | 4.84 | 5.259 | 5.714 |
| 1.663999999999784 | 4.859 | 5.28 | 5.739 |
| 1.667999999999784 | 4.877 | 5.302 | 5.763 |
| 1.671999999999784 | 4.896 | 5.323 | 5.787 |
| 1.675999999999784 | 4.915 | 5.344 | 5.811 |
| 1.679999999999784 | 4.933 | 5.366 | 5.836 |
| 1.683999999999784 | 4.952 | 5.387 | 5.86 |
| 1.687999999999784 | 4.971 | 5.409 | 5.885 |
| 1.691999999999784 | 4.99 | 5.43 | 5.91 |
| 1.695999999999784 | 5.009 | 5.452 | 5.935 |
| 1.699999999999784 | 5.028 | 5.474 | 5.96 |
| 1.703999999999785 | 5.047 | 5.496 | 5.985 |
| 1.707999999999785 | 5.066 | 5.518 | 6.01 |
| 1.711999999999785 | 5.086 | 5.54 | 6.035 |
| 1.715999999999785 | 5.105 | 5.562 | 6.061 |
| 1.719999999999785 | 5.124 | 5.585 | 6.086 |
| 1.723999999999785 | 5.144 | 5.607 | 6.112 |
| 1.727999999999785 | 5.163 | 5.629 | 6.137 |
| 1.731999999999785 | 5.183 | 5.652 | 6.163 |
| 1.735999999999785 | 5.203 | 5.675 | 6.189 |
| 1.739999999999785 | 5.223 | 5.697 | 6.215 |
| 1.743999999999785 | 5.243 | 5.72 | 6.241 |
| 1.747999999999785 | 5.262 | 5.743 | 6.268 |
| 1.751999999999785 | 5.283 | 5.766 | 6.294 |
| 1.755999999999785 | 5.303 | 5.789 | 6.321 |
| 1.759999999999785 | 5.323 | 5.812 | 6.347 |
| 1.763999999999785 | 5.343 | 5.836 | 6.374 |
| 1.767999999999785 | 5.363 | 5.859 | 6.401 |
| 1.771999999999785 | 5.384 | 5.883 | 6.428 |
| 1.775999999999785 | 5.404 | 5.906 | 6.455 |
| 1.779999999999785 | 5.425 | 5.93 | 6.482 |
| 1.783999999999785 | 5.446 | 5.954 | 6.509 |
| 1.787999999999785 | 5.466 | 5.977 | 6.536 |
| 1.791999999999785 | 5.487 | 6.001 | 6.564 |
| 1.795999999999785 | 5.508 | 6.025 | 6.592 |
| 1.799999999999785 | 5.529 | 6.05 | 6.619 |
| 1.803999999999785 | 5.55 | 6.074 | 6.647 |
| 1.807999999999785 | 5.571 | 6.098 | 6.675 |
| 1.811999999999785 | 5.592 | 6.123 | 6.703 |
| 1.815999999999785 | 5.614 | 6.147 | 6.732 |
| 1.819999999999785 | 5.635 | 6.172 | 6.76 |
| 1.823999999999785 | 5.656 | 6.197 | 6.788 |
| 1.827999999999785 | 5.678 | 6.221 | 6.817 |
| 1.831999999999785 | 5.7 | 6.246 | 6.846 |
| 1.835999999999785 | 5.721 | 6.271 | 6.874 |
| 1.839999999999785 | 5.743 | 6.297 | 6.903 |
| 1.843999999999785 | 5.765 | 6.322 | 6.932 |
| 1.847999999999785 | 5.787 | 6.347 | 6.962 |
| 1.851999999999785 | 5.809 | 6.373 | 6.991 |
| 1.855999999999785 | 5.831 | 6.398 | 7.02 |
| 1.859999999999785 | 5.853 | 6.424 | 7.05 |
| 1.863999999999785 | 5.876 | 6.449 | 7.079 |
| 1.867999999999785 | 5.898 | 6.475 | 7.109 |
| 1.871999999999785 | 5.92 | 6.501 | 7.139 |
| 1.875999999999785 | 5.943 | 6.527 | 7.169 |
| 1.879999999999785 | 5.966 | 6.554 | 7.199 |
| 1.883999999999785 | 5.988 | 6.58 | 7.23 |
| 1.887999999999785 | 6.011 | 6.606 | 7.26 |
| 1.891999999999785 | 6.034 | 6.633 | 7.291 |
| 1.895999999999785 | 6.057 | 6.659 | 7.321 |
| 1.899999999999785 | 6.08 | 6.686 | 7.352 |
| 1.903999999999785 | 6.103 | 6.713 | 7.383 |
| 1.907999999999785 | 6.126 | 6.74 | 7.414 |
| 1.911999999999785 | 6.15 | 6.767 | 7.445 |
| 1.915999999999785 | 6.173 | 6.794 | 7.477 |
| 1.919999999999785 | 6.197 | 6.821 | 7.508 |
| 1.923999999999785 | 6.22 | 6.848 | 7.54 |
| 1.927999999999785 | 6.244 | 6.876 | 7.572 |
| 1.931999999999785 | 6.268 | 6.903 | 7.603 |
| 1.935999999999785 | 6.292 | 6.931 | 7.635 |
| 1.939999999999785 | 6.315 | 6.959 | 7.668 |
| 1.943999999999785 | 6.34 | 6.987 | 7.7 |
| 1.947999999999785 | 6.364 | 7.015 | 7.732 |
| 1.951999999999785 | 6.388 | 7.043 | 7.765 |
| 1.955999999999785 | 6.412 | 7.071 | 7.797 |
| 1.959999999999785 | 6.437 | 7.099 | 7.83 |
| 1.963999999999785 | 6.461 | 7.128 | 7.863 |
| 1.967999999999785 | 6.486 | 7.156 | 7.896 |
| 1.971999999999785 | 6.51 | 7.185 | 7.93 |
| 1.975999999999785 | 6.535 | 7.214 | 7.963 |
| 1.979999999999785 | 6.56 | 7.243 | 7.996 |
| 1.983999999999785 | 6.585 | 7.272 | 8.03 |
| 1.987999999999785 | 6.61 | 7.301 | 8.064 |
| 1.991999999999785 | 6.635 | 7.33 | 8.098 |
| 1.995999999999785 | 6.661 | 7.36 | 8.132 |
| 1.999999999999785 | 6.686 | 7.389 | 8.166 |